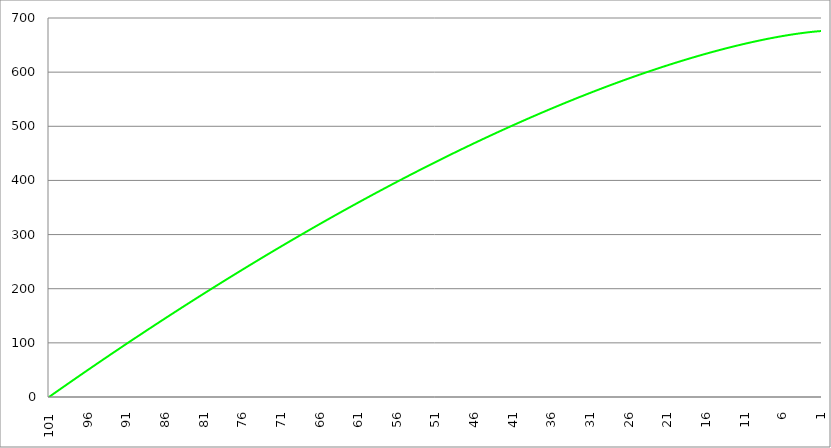
| Category | Series 1 | Series 0 | Series 2 |
|---|---|---|---|
| 101.0 |  | 0 |  |
| 100.95 |  | 0.502 |  |
| 100.9 |  | 1.005 |  |
| 100.85 |  | 1.507 |  |
| 100.8 |  | 2.009 |  |
| 100.75 |  | 2.511 |  |
| 100.7 |  | 3.013 |  |
| 100.65 |  | 3.514 |  |
| 100.6 |  | 4.016 |  |
| 100.55 |  | 4.517 |  |
| 100.5 |  | 5.019 |  |
| 100.45 |  | 5.52 |  |
| 100.4 |  | 6.021 |  |
| 100.35 |  | 6.522 |  |
| 100.3 |  | 7.023 |  |
| 100.25 |  | 7.523 |  |
| 100.2 |  | 8.024 |  |
| 100.15 |  | 8.524 |  |
| 100.1000000000001 |  | 9.025 |  |
| 100.0500000000001 |  | 9.525 |  |
| 100.0000000000001 |  | 10.025 |  |
| 99.95000000000005 |  | 10.525 |  |
| 99.90000000000006 |  | 11.025 |  |
| 99.85000000000007 |  | 11.524 |  |
| 99.80000000000007 |  | 12.024 |  |
| 99.75000000000007 |  | 12.523 |  |
| 99.70000000000007 |  | 13.023 |  |
| 99.65000000000008 |  | 13.522 |  |
| 99.60000000000008 |  | 14.021 |  |
| 99.55000000000008 |  | 14.52 |  |
| 99.50000000000009 |  | 15.019 |  |
| 99.45000000000007 |  | 15.517 |  |
| 99.4000000000001 |  | 16.016 |  |
| 99.3500000000001 |  | 16.514 |  |
| 99.3000000000001 |  | 17.013 |  |
| 99.2500000000001 |  | 17.511 |  |
| 99.2000000000001 |  | 18.009 |  |
| 99.1500000000001 |  | 18.507 |  |
| 99.10000000000011 |  | 19.005 |  |
| 99.05000000000011 |  | 19.502 |  |
| 99.00000000000011 |  | 20 |  |
| 98.95000000000012 |  | 20.497 |  |
| 98.9000000000001 |  | 20.995 |  |
| 98.85000000000012 |  | 21.492 |  |
| 98.80000000000013 |  | 21.989 |  |
| 98.75000000000013 |  | 22.486 |  |
| 98.70000000000013 |  | 22.983 |  |
| 98.65000000000013 |  | 23.479 |  |
| 98.60000000000014 |  | 23.976 |  |
| 98.55000000000014 |  | 24.472 |  |
| 98.50000000000014 |  | 24.969 |  |
| 98.45000000000014 |  | 25.465 |  |
| 98.40000000000013 |  | 25.961 |  |
| 98.35000000000015 |  | 26.457 |  |
| 98.30000000000015 |  | 26.953 |  |
| 98.25000000000016 |  | 27.448 |  |
| 98.20000000000014 |  | 27.944 |  |
| 98.15000000000016 |  | 28.439 |  |
| 98.10000000000016 |  | 28.934 |  |
| 98.05000000000017 |  | 29.43 |  |
| 98.00000000000017 |  | 29.925 |  |
| 97.95000000000017 |  | 30.42 |  |
| 97.90000000000018 |  | 30.914 |  |
| 97.85000000000018 |  | 31.409 |  |
| 97.80000000000018 |  | 31.904 |  |
| 97.75000000000018 |  | 32.398 |  |
| 97.70000000000017 |  | 32.892 |  |
| 97.65000000000019 |  | 33.386 |  |
| 97.6000000000002 |  | 33.88 |  |
| 97.5500000000002 |  | 34.374 |  |
| 97.5000000000002 |  | 34.868 |  |
| 97.4500000000002 |  | 35.362 |  |
| 97.4000000000002 |  | 35.855 |  |
| 97.35000000000021 |  | 36.349 |  |
| 97.30000000000021 |  | 36.842 |  |
| 97.25000000000021 |  | 37.335 |  |
| 97.20000000000022 |  | 37.828 |  |
| 97.15000000000022 |  | 38.321 |  |
| 97.10000000000022 |  | 38.814 |  |
| 97.05000000000022 |  | 39.306 |  |
| 97.00000000000023 |  | 39.799 |  |
| 96.95000000000023 |  | 40.291 |  |
| 96.90000000000023 |  | 40.783 |  |
| 96.85000000000024 |  | 41.276 |  |
| 96.80000000000024 |  | 41.768 |  |
| 96.75000000000024 |  | 42.259 |  |
| 96.70000000000024 |  | 42.751 |  |
| 96.65000000000025 |  | 43.243 |  |
| 96.60000000000025 |  | 43.734 |  |
| 96.55000000000025 |  | 44.226 |  |
| 96.50000000000026 |  | 44.717 |  |
| 96.45000000000024 |  | 45.208 |  |
| 96.40000000000026 |  | 45.699 |  |
| 96.35000000000026 |  | 46.19 |  |
| 96.30000000000027 |  | 46.681 |  |
| 96.25000000000027 |  | 47.171 |  |
| 96.20000000000027 |  | 47.662 |  |
| 96.15000000000028 |  | 48.152 |  |
| 96.10000000000028 |  | 48.642 |  |
| 96.05000000000028 |  | 49.132 |  |
| 96.00000000000028 |  | 49.622 |  |
| 95.95000000000029 |  | 50.112 |  |
| 95.90000000000028 |  | 50.602 |  |
| 95.85000000000029 |  | 51.091 |  |
| 95.8000000000003 |  | 51.581 |  |
| 95.7500000000003 |  | 52.07 |  |
| 95.7000000000003 |  | 52.559 |  |
| 95.6500000000003 |  | 53.048 |  |
| 95.6000000000003 |  | 53.537 |  |
| 95.55000000000031 |  | 54.026 |  |
| 95.50000000000031 |  | 54.515 |  |
| 95.45000000000032 |  | 55.003 |  |
| 95.4000000000003 |  | 55.492 |  |
| 95.35000000000032 |  | 55.98 |  |
| 95.30000000000032 |  | 56.468 |  |
| 95.25000000000033 |  | 56.956 |  |
| 95.20000000000033 |  | 57.444 |  |
| 95.15000000000033 |  | 57.932 |  |
| 95.10000000000034 |  | 58.42 |  |
| 95.05000000000034 |  | 58.907 |  |
| 95.00000000000034 |  | 59.395 |  |
| 94.95000000000034 |  | 59.882 |  |
| 94.90000000000035 |  | 60.369 |  |
| 94.85000000000035 |  | 60.856 |  |
| 94.80000000000035 |  | 61.343 |  |
| 94.75000000000036 |  | 61.83 |  |
| 94.70000000000034 |  | 62.316 |  |
| 94.65000000000036 |  | 62.803 |  |
| 94.60000000000036 |  | 63.289 |  |
| 94.55000000000037 |  | 63.776 |  |
| 94.50000000000037 |  | 64.262 |  |
| 94.45000000000037 |  | 64.748 |  |
| 94.40000000000038 |  | 65.233 |  |
| 94.35000000000038 |  | 65.719 |  |
| 94.30000000000038 |  | 66.205 |  |
| 94.25000000000038 |  | 66.69 |  |
| 94.20000000000039 |  | 67.176 |  |
| 94.15000000000039 |  | 67.661 |  |
| 94.10000000000039 |  | 68.146 |  |
| 94.0500000000004 |  | 68.631 |  |
| 94.0000000000004 |  | 69.116 |  |
| 93.9500000000004 |  | 69.6 |  |
| 93.9000000000004 |  | 70.085 |  |
| 93.8500000000004 |  | 70.569 |  |
| 93.80000000000041 |  | 71.054 |  |
| 93.75000000000041 |  | 71.538 |  |
| 93.70000000000041 |  | 72.022 |  |
| 93.65000000000042 |  | 72.506 |  |
| 93.60000000000042 |  | 72.99 |  |
| 93.55000000000042 |  | 73.473 |  |
| 93.50000000000043 |  | 73.957 |  |
| 93.45000000000043 |  | 74.44 |  |
| 93.40000000000043 |  | 74.924 |  |
| 93.35000000000043 |  | 75.407 |  |
| 93.30000000000044 |  | 75.89 |  |
| 93.25000000000044 |  | 76.373 |  |
| 93.20000000000044 |  | 76.856 |  |
| 93.15000000000045 |  | 77.338 |  |
| 93.10000000000045 |  | 77.821 |  |
| 93.05000000000045 |  | 78.303 |  |
| 93.00000000000045 |  | 78.785 |  |
| 92.95000000000044 |  | 79.267 |  |
| 92.90000000000046 |  | 79.749 |  |
| 92.85000000000046 |  | 80.231 |  |
| 92.80000000000047 |  | 80.713 |  |
| 92.75000000000047 |  | 81.195 |  |
| 92.70000000000047 |  | 81.676 |  |
| 92.65000000000047 |  | 82.157 |  |
| 92.60000000000048 |  | 82.639 |  |
| 92.55000000000048 |  | 83.12 |  |
| 92.50000000000048 |  | 83.601 |  |
| 92.45000000000049 |  | 84.081 |  |
| 92.40000000000047 |  | 84.562 |  |
| 92.35000000000049 |  | 85.043 |  |
| 92.3000000000005 |  | 85.523 |  |
| 92.2500000000005 |  | 86.003 |  |
| 92.2000000000005 |  | 86.484 |  |
| 92.1500000000005 |  | 86.964 |  |
| 92.1000000000005 |  | 87.444 |  |
| 92.05000000000051 |  | 87.923 |  |
| 92.00000000000051 |  | 88.403 |  |
| 91.95000000000051 |  | 88.882 |  |
| 91.9000000000005 |  | 89.362 |  |
| 91.85000000000052 |  | 89.841 |  |
| 91.80000000000052 |  | 90.32 |  |
| 91.75000000000053 |  | 90.799 |  |
| 91.70000000000053 |  | 91.278 |  |
| 91.65000000000053 |  | 91.757 |  |
| 91.60000000000053 |  | 92.235 |  |
| 91.55000000000054 |  | 92.714 |  |
| 91.50000000000054 |  | 93.192 |  |
| 91.45000000000054 |  | 93.67 |  |
| 91.40000000000055 |  | 94.149 |  |
| 91.35000000000055 |  | 94.627 |  |
| 91.30000000000055 |  | 95.104 |  |
| 91.25000000000055 |  | 95.582 |  |
| 91.20000000000056 |  | 96.06 |  |
| 91.15000000000056 |  | 96.537 |  |
| 91.10000000000056 |  | 97.014 |  |
| 91.05000000000057 |  | 97.491 |  |
| 91.00000000000057 |  | 97.969 |  |
| 90.95000000000057 |  | 98.445 |  |
| 90.90000000000057 |  | 98.922 |  |
| 90.85000000000058 |  | 99.399 |  |
| 90.80000000000058 |  | 99.875 |  |
| 90.75000000000058 |  | 100.352 |  |
| 90.70000000000059 |  | 100.828 |  |
| 90.65000000000059 |  | 101.304 |  |
| 90.60000000000059 |  | 101.78 |  |
| 90.5500000000006 |  | 102.256 |  |
| 90.5000000000006 |  | 102.732 |  |
| 90.4500000000006 |  | 103.207 |  |
| 90.4000000000006 |  | 103.683 |  |
| 90.3500000000006 |  | 104.158 |  |
| 90.30000000000061 |  | 104.633 |  |
| 90.25000000000061 |  | 105.108 |  |
| 90.20000000000061 |  | 105.583 |  |
| 90.15000000000062 |  | 106.058 |  |
| 90.10000000000062 |  | 106.533 |  |
| 90.05000000000062 |  | 107.007 |  |
| 90.00000000000063 |  | 107.482 |  |
| 89.95000000000063 |  | 107.956 |  |
| 89.90000000000063 |  | 108.43 |  |
| 89.85000000000063 |  | 108.904 |  |
| 89.80000000000064 |  | 109.378 |  |
| 89.75000000000064 |  | 109.852 |  |
| 89.70000000000064 |  | 110.325 |  |
| 89.65000000000065 |  | 110.799 |  |
| 89.60000000000065 |  | 111.272 |  |
| 89.55000000000065 |  | 111.745 |  |
| 89.50000000000065 |  | 112.218 |  |
| 89.45000000000066 |  | 112.691 |  |
| 89.40000000000065 |  | 113.164 |  |
| 89.35000000000066 |  | 113.637 |  |
| 89.30000000000067 |  | 114.109 |  |
| 89.25000000000067 |  | 114.582 |  |
| 89.20000000000067 |  | 115.054 |  |
| 89.15000000000067 |  | 115.526 |  |
| 89.10000000000068 |  | 115.998 |  |
| 89.05000000000068 |  | 116.47 |  |
| 89.00000000000068 |  | 116.942 |  |
| 88.95000000000068 |  | 117.414 |  |
| 88.90000000000067 |  | 117.885 |  |
| 88.85000000000069 |  | 118.357 |  |
| 88.8000000000007 |  | 118.828 |  |
| 88.7500000000007 |  | 119.299 |  |
| 88.7000000000007 |  | 119.77 |  |
| 88.6500000000007 |  | 120.241 |  |
| 88.6000000000007 |  | 120.711 |  |
| 88.55000000000071 |  | 121.182 |  |
| 88.50000000000071 |  | 121.652 |  |
| 88.45000000000071 |  | 122.123 |  |
| 88.40000000000072 |  | 122.593 |  |
| 88.35000000000072 |  | 123.063 |  |
| 88.30000000000072 |  | 123.533 |  |
| 88.25000000000072 |  | 124.003 |  |
| 88.20000000000073 |  | 124.472 |  |
| 88.15000000000073 |  | 124.942 |  |
| 88.10000000000073 |  | 125.411 |  |
| 88.05000000000074 |  | 125.88 |  |
| 88.00000000000074 |  | 126.35 |  |
| 87.95000000000074 |  | 126.818 |  |
| 87.90000000000074 |  | 127.287 |  |
| 87.85000000000075 |  | 127.756 |  |
| 87.80000000000075 |  | 128.225 |  |
| 87.75000000000075 |  | 128.693 |  |
| 87.70000000000076 |  | 129.161 |  |
| 87.65000000000076 |  | 129.63 |  |
| 87.60000000000076 |  | 130.098 |  |
| 87.55000000000076 |  | 130.565 |  |
| 87.50000000000077 |  | 131.033 |  |
| 87.45000000000077 |  | 131.501 |  |
| 87.40000000000077 |  | 131.968 |  |
| 87.35000000000078 |  | 132.436 |  |
| 87.30000000000078 |  | 132.903 |  |
| 87.25000000000078 |  | 133.37 |  |
| 87.20000000000078 |  | 133.837 |  |
| 87.15000000000079 |  | 134.304 |  |
| 87.10000000000079 |  | 134.771 |  |
| 87.0500000000008 |  | 135.237 |  |
| 87.0000000000008 |  | 135.704 |  |
| 86.9500000000008 |  | 136.17 |  |
| 86.9000000000008 |  | 136.636 |  |
| 86.8500000000008 |  | 137.102 |  |
| 86.80000000000081 |  | 137.568 |  |
| 86.75000000000081 |  | 138.034 |  |
| 86.70000000000081 |  | 138.499 |  |
| 86.65000000000082 |  | 138.965 |  |
| 86.60000000000082 |  | 139.43 |  |
| 86.55000000000082 |  | 139.896 |  |
| 86.50000000000082 |  | 140.361 |  |
| 86.45000000000083 |  | 140.826 |  |
| 86.40000000000083 |  | 141.29 |  |
| 86.35000000000083 |  | 141.755 |  |
| 86.30000000000084 |  | 142.22 |  |
| 86.25000000000084 |  | 142.684 |  |
| 86.20000000000084 |  | 143.148 |  |
| 86.15000000000084 |  | 143.613 |  |
| 86.10000000000085 |  | 144.077 |  |
| 86.05000000000085 |  | 144.54 |  |
| 86.00000000000085 |  | 145.004 |  |
| 85.95000000000086 |  | 145.468 |  |
| 85.90000000000084 |  | 145.931 |  |
| 85.85000000000086 |  | 146.395 |  |
| 85.80000000000086 |  | 146.858 |  |
| 85.75000000000087 |  | 147.321 |  |
| 85.70000000000087 |  | 147.784 |  |
| 85.65000000000087 |  | 148.247 |  |
| 85.60000000000088 |  | 148.709 |  |
| 85.55000000000088 |  | 149.172 |  |
| 85.50000000000088 |  | 149.634 |  |
| 85.45000000000088 |  | 150.096 |  |
| 85.40000000000089 |  | 150.559 |  |
| 85.35000000000089 |  | 151.021 |  |
| 85.30000000000089 |  | 151.482 |  |
| 85.2500000000009 |  | 151.944 |  |
| 85.2000000000009 |  | 152.406 |  |
| 85.1500000000009 |  | 152.867 |  |
| 85.1000000000009 |  | 153.329 |  |
| 85.0500000000009 |  | 153.79 |  |
| 85.00000000000091 |  | 154.251 |  |
| 84.95000000000091 |  | 154.712 |  |
| 84.90000000000092 |  | 155.172 |  |
| 84.85000000000092 |  | 155.633 |  |
| 84.80000000000092 |  | 156.094 |  |
| 84.75000000000092 |  | 156.554 |  |
| 84.70000000000093 |  | 157.014 |  |
| 84.65000000000093 |  | 157.474 |  |
| 84.60000000000093 |  | 157.934 |  |
| 84.55000000000094 |  | 158.394 |  |
| 84.50000000000094 |  | 158.854 |  |
| 84.45000000000094 |  | 159.313 |  |
| 84.40000000000094 |  | 159.773 |  |
| 84.35000000000095 |  | 160.232 |  |
| 84.30000000000095 |  | 160.691 |  |
| 84.25000000000095 |  | 161.15 |  |
| 84.20000000000095 |  | 161.609 |  |
| 84.15000000000096 |  | 162.068 |  |
| 84.10000000000096 |  | 162.526 |  |
| 84.05000000000096 |  | 162.985 |  |
| 84.00000000000097 |  | 163.443 |  |
| 83.95000000000097 |  | 163.901 |  |
| 83.90000000000097 |  | 164.359 |  |
| 83.85000000000097 |  | 164.817 |  |
| 83.80000000000098 |  | 165.275 |  |
| 83.75000000000098 |  | 165.733 |  |
| 83.70000000000098 |  | 166.19 |  |
| 83.65000000000099 |  | 166.648 |  |
| 83.60000000000099 |  | 167.105 |  |
| 83.55000000000099 |  | 167.562 |  |
| 83.500000000001 |  | 168.019 |  |
| 83.450000000001 |  | 168.476 |  |
| 83.400000000001 |  | 168.932 |  |
| 83.350000000001 |  | 169.389 |  |
| 83.300000000001 |  | 169.845 |  |
| 83.25000000000101 |  | 170.302 |  |
| 83.20000000000101 |  | 170.758 |  |
| 83.15000000000101 |  | 171.214 |  |
| 83.10000000000102 |  | 171.67 |  |
| 83.05000000000102 |  | 172.125 |  |
| 83.00000000000102 |  | 172.581 |  |
| 82.95000000000103 |  | 173.036 |  |
| 82.90000000000103 |  | 173.492 |  |
| 82.85000000000103 |  | 173.947 |  |
| 82.80000000000103 |  | 174.402 |  |
| 82.75000000000104 |  | 174.857 |  |
| 82.70000000000104 |  | 175.312 |  |
| 82.65000000000104 |  | 175.766 |  |
| 82.60000000000105 |  | 176.221 |  |
| 82.55000000000105 |  | 176.675 |  |
| 82.50000000000105 |  | 177.129 |  |
| 82.45000000000105 |  | 177.583 |  |
| 82.40000000000104 |  | 178.037 |  |
| 82.35000000000106 |  | 178.491 |  |
| 82.30000000000106 |  | 178.945 |  |
| 82.25000000000107 |  | 179.398 |  |
| 82.20000000000107 |  | 179.852 |  |
| 82.15000000000107 |  | 180.305 |  |
| 82.10000000000107 |  | 180.758 |  |
| 82.05000000000108 |  | 181.211 |  |
| 82.00000000000108 |  | 181.664 |  |
| 81.95000000000108 |  | 182.117 |  |
| 81.90000000000109 |  | 182.569 |  |
| 81.85000000000109 |  | 183.022 |  |
| 81.80000000000109 |  | 183.474 |  |
| 81.7500000000011 |  | 183.926 |  |
| 81.7000000000011 |  | 184.378 |  |
| 81.6500000000011 |  | 184.83 |  |
| 81.6000000000011 |  | 185.282 |  |
| 81.5500000000011 |  | 185.733 |  |
| 81.50000000000111 |  | 186.185 |  |
| 81.45000000000111 |  | 186.636 |  |
| 81.40000000000111 |  | 187.087 |  |
| 81.35000000000112 |  | 187.538 |  |
| 81.30000000000112 |  | 187.989 |  |
| 81.25000000000112 |  | 188.44 |  |
| 81.20000000000113 |  | 188.891 |  |
| 81.15000000000113 |  | 189.341 |  |
| 81.10000000000113 |  | 189.791 |  |
| 81.05000000000113 |  | 190.242 |  |
| 81.00000000000114 |  | 190.692 |  |
| 80.95000000000114 |  | 191.142 |  |
| 80.90000000000114 |  | 191.591 |  |
| 80.85000000000115 |  | 192.041 |  |
| 80.80000000000115 |  | 192.491 |  |
| 80.75000000000115 |  | 192.94 |  |
| 80.70000000000115 |  | 193.389 |  |
| 80.65000000000116 |  | 193.838 |  |
| 80.60000000000116 |  | 194.287 |  |
| 80.55000000000116 |  | 194.736 |  |
| 80.50000000000117 |  | 195.185 |  |
| 80.45000000000117 |  | 195.633 |  |
| 80.40000000000117 |  | 196.082 |  |
| 80.35000000000117 |  | 196.53 |  |
| 80.30000000000118 |  | 196.978 |  |
| 80.25000000000118 |  | 197.426 |  |
| 80.20000000000118 |  | 197.874 |  |
| 80.15000000000119 |  | 198.322 |  |
| 80.10000000000119 |  | 198.769 |  |
| 80.05000000000119 |  | 199.217 |  |
| 80.0000000000012 |  | 199.664 |  |
| 79.9500000000012 |  | 200.111 |  |
| 79.9000000000012 |  | 200.558 |  |
| 79.8500000000012 |  | 201.005 |  |
| 79.8000000000012 |  | 201.452 |  |
| 79.75000000000121 |  | 201.898 |  |
| 79.70000000000121 |  | 202.345 |  |
| 79.65000000000121 |  | 202.791 |  |
| 79.60000000000122 |  | 203.237 |  |
| 79.55000000000122 |  | 203.683 |  |
| 79.50000000000122 |  | 204.129 |  |
| 79.45000000000122 |  | 204.575 |  |
| 79.40000000000123 |  | 205.02 |  |
| 79.35000000000123 |  | 205.466 |  |
| 79.30000000000123 |  | 205.911 |  |
| 79.25000000000124 |  | 206.356 |  |
| 79.20000000000124 |  | 206.801 |  |
| 79.15000000000124 |  | 207.246 |  |
| 79.10000000000124 |  | 207.691 |  |
| 79.05000000000125 |  | 208.136 |  |
| 79.00000000000125 |  | 208.58 |  |
| 78.95000000000125 |  | 209.024 |  |
| 78.90000000000126 |  | 209.469 |  |
| 78.85000000000126 |  | 209.913 |  |
| 78.80000000000126 |  | 210.357 |  |
| 78.75000000000126 |  | 210.8 |  |
| 78.70000000000127 |  | 211.244 |  |
| 78.65000000000127 |  | 211.687 |  |
| 78.60000000000127 |  | 212.131 |  |
| 78.55000000000128 |  | 212.574 |  |
| 78.50000000000128 |  | 213.017 |  |
| 78.45000000000128 |  | 213.46 |  |
| 78.40000000000128 |  | 213.903 |  |
| 78.35000000000129 |  | 214.345 |  |
| 78.30000000000129 |  | 214.788 |  |
| 78.2500000000013 |  | 215.23 |  |
| 78.2000000000013 |  | 215.673 |  |
| 78.1500000000013 |  | 216.115 |  |
| 78.1000000000013 |  | 216.557 |  |
| 78.0500000000013 |  | 216.998 |  |
| 78.00000000000131 |  | 217.44 |  |
| 77.95000000000131 |  | 217.882 |  |
| 77.90000000000131 |  | 218.323 |  |
| 77.85000000000132 |  | 218.764 |  |
| 77.80000000000132 |  | 219.205 |  |
| 77.75000000000132 |  | 219.646 |  |
| 77.70000000000132 |  | 220.087 |  |
| 77.65000000000133 |  | 220.528 |  |
| 77.60000000000133 |  | 220.968 |  |
| 77.55000000000133 |  | 221.409 |  |
| 77.50000000000134 |  | 221.849 |  |
| 77.45000000000134 |  | 222.289 |  |
| 77.40000000000134 |  | 222.729 |  |
| 77.35000000000134 |  | 223.169 |  |
| 77.30000000000135 |  | 223.608 |  |
| 77.25000000000135 |  | 224.048 |  |
| 77.20000000000135 |  | 224.487 |  |
| 77.15000000000136 |  | 224.927 |  |
| 77.10000000000136 |  | 225.366 |  |
| 77.05000000000136 |  | 225.805 |  |
| 77.00000000000136 |  | 226.243 |  |
| 76.95000000000137 |  | 226.682 |  |
| 76.90000000000137 |  | 227.121 |  |
| 76.85000000000137 |  | 227.559 |  |
| 76.80000000000138 |  | 227.997 |  |
| 76.75000000000138 |  | 228.435 |  |
| 76.70000000000138 |  | 228.873 |  |
| 76.65000000000138 |  | 229.311 |  |
| 76.60000000000139 |  | 229.749 |  |
| 76.55000000000139 |  | 230.186 |  |
| 76.50000000000139 |  | 230.624 |  |
| 76.4500000000014 |  | 231.061 |  |
| 76.4000000000014 |  | 231.498 |  |
| 76.3500000000014 |  | 231.935 |  |
| 76.3000000000014 |  | 232.372 |  |
| 76.2500000000014 |  | 232.809 |  |
| 76.20000000000141 |  | 233.245 |  |
| 76.15000000000141 |  | 233.682 |  |
| 76.10000000000142 |  | 234.118 |  |
| 76.05000000000142 |  | 234.554 |  |
| 76.00000000000142 |  | 234.99 |  |
| 75.95000000000142 |  | 235.426 |  |
| 75.90000000000143 |  | 235.861 |  |
| 75.85000000000143 |  | 236.297 |  |
| 75.80000000000143 |  | 236.732 |  |
| 75.75000000000144 |  | 237.168 |  |
| 75.70000000000144 |  | 237.603 |  |
| 75.65000000000144 |  | 238.038 |  |
| 75.60000000000144 |  | 238.472 |  |
| 75.55000000000145 |  | 238.907 |  |
| 75.50000000000145 |  | 239.342 |  |
| 75.45000000000145 |  | 239.776 |  |
| 75.40000000000146 |  | 240.21 |  |
| 75.35000000000146 |  | 240.644 |  |
| 75.30000000000146 |  | 241.078 |  |
| 75.25000000000146 |  | 241.512 |  |
| 75.20000000000147 |  | 241.946 |  |
| 75.15000000000147 |  | 242.379 |  |
| 75.10000000000147 |  | 242.813 |  |
| 75.05000000000148 |  | 243.246 |  |
| 75.00000000000148 |  | 243.679 |  |
| 74.95000000000148 |  | 244.112 |  |
| 74.90000000000148 |  | 244.545 |  |
| 74.85000000000149 |  | 244.977 |  |
| 74.80000000000149 |  | 245.41 |  |
| 74.75000000000149 |  | 245.842 |  |
| 74.7000000000015 |  | 246.274 |  |
| 74.6500000000015 |  | 246.706 |  |
| 74.6000000000015 |  | 247.138 |  |
| 74.5500000000015 |  | 247.57 |  |
| 74.5000000000015 |  | 248.002 |  |
| 74.45000000000151 |  | 248.433 |  |
| 74.40000000000151 |  | 248.865 |  |
| 74.35000000000151 |  | 249.296 |  |
| 74.30000000000152 |  | 249.727 |  |
| 74.25000000000152 |  | 250.158 |  |
| 74.20000000000152 |  | 250.589 |  |
| 74.15000000000153 |  | 251.019 |  |
| 74.10000000000153 |  | 251.45 |  |
| 74.05000000000153 |  | 251.88 |  |
| 74.00000000000153 |  | 252.31 |  |
| 73.95000000000154 |  | 252.74 |  |
| 73.90000000000154 |  | 253.17 |  |
| 73.85000000000154 |  | 253.6 |  |
| 73.80000000000155 |  | 254.03 |  |
| 73.75000000000155 |  | 254.459 |  |
| 73.70000000000155 |  | 254.888 |  |
| 73.65000000000155 |  | 255.317 |  |
| 73.60000000000156 |  | 255.747 |  |
| 73.55000000000156 |  | 256.175 |  |
| 73.50000000000156 |  | 256.604 |  |
| 73.45000000000157 |  | 257.033 |  |
| 73.40000000000157 |  | 257.461 |  |
| 73.35000000000157 |  | 257.889 |  |
| 73.30000000000157 |  | 258.318 |  |
| 73.25000000000158 |  | 258.746 |  |
| 73.20000000000158 |  | 259.173 |  |
| 73.15000000000158 |  | 259.601 |  |
| 73.10000000000159 |  | 260.029 |  |
| 73.05000000000159 |  | 260.456 |  |
| 73.00000000000159 |  | 260.883 |  |
| 72.9500000000016 |  | 261.311 |  |
| 72.9000000000016 |  | 261.738 |  |
| 72.8500000000016 |  | 262.164 |  |
| 72.8000000000016 |  | 262.591 |  |
| 72.7500000000016 |  | 263.018 |  |
| 72.70000000000161 |  | 263.444 |  |
| 72.65000000000161 |  | 263.87 |  |
| 72.60000000000161 |  | 264.296 |  |
| 72.55000000000162 |  | 264.722 |  |
| 72.50000000000162 |  | 265.148 |  |
| 72.45000000000162 |  | 265.574 |  |
| 72.40000000000163 |  | 265.999 |  |
| 72.35000000000163 |  | 266.425 |  |
| 72.30000000000163 |  | 266.85 |  |
| 72.25000000000163 |  | 267.275 |  |
| 72.20000000000164 |  | 267.7 |  |
| 72.15000000000164 |  | 268.125 |  |
| 72.10000000000164 |  | 268.549 |  |
| 72.05000000000165 |  | 268.974 |  |
| 72.00000000000165 |  | 269.398 |  |
| 71.95000000000165 |  | 269.822 |  |
| 71.90000000000165 |  | 270.246 |  |
| 71.85000000000166 |  | 270.67 |  |
| 71.80000000000166 |  | 271.094 |  |
| 71.75000000000166 |  | 271.518 |  |
| 71.70000000000167 |  | 271.941 |  |
| 71.65000000000167 |  | 272.364 |  |
| 71.60000000000167 |  | 272.788 |  |
| 71.55000000000167 |  | 273.211 |  |
| 71.50000000000168 |  | 273.633 |  |
| 71.45000000000168 |  | 274.056 |  |
| 71.40000000000168 |  | 274.479 |  |
| 71.35000000000169 |  | 274.901 |  |
| 71.30000000000169 |  | 275.323 |  |
| 71.25000000000169 |  | 275.745 |  |
| 71.2000000000017 |  | 276.167 |  |
| 71.1500000000017 |  | 276.589 |  |
| 71.1000000000017 |  | 277.011 |  |
| 71.0500000000017 |  | 277.432 |  |
| 71.0000000000017 |  | 277.854 |  |
| 70.95000000000171 |  | 278.275 |  |
| 70.90000000000171 |  | 278.696 |  |
| 70.85000000000171 |  | 279.117 |  |
| 70.80000000000172 |  | 279.538 |  |
| 70.75000000000172 |  | 279.959 |  |
| 70.70000000000172 |  | 280.379 |  |
| 70.65000000000173 |  | 280.799 |  |
| 70.60000000000173 |  | 281.22 |  |
| 70.55000000000173 |  | 281.64 |  |
| 70.50000000000173 |  | 282.06 |  |
| 70.45000000000174 |  | 282.479 |  |
| 70.40000000000174 |  | 282.899 |  |
| 70.35000000000174 |  | 283.318 |  |
| 70.30000000000175 |  | 283.738 |  |
| 70.25000000000175 |  | 284.157 |  |
| 70.20000000000175 |  | 284.576 |  |
| 70.15000000000175 |  | 284.995 |  |
| 70.10000000000176 |  | 285.413 |  |
| 70.05000000000176 |  | 285.832 |  |
| 70.00000000000176 |  | 286.25 |  |
| 69.95000000000176 |  | 286.669 |  |
| 69.90000000000177 |  | 287.087 |  |
| 69.85000000000177 |  | 287.505 |  |
| 69.80000000000177 |  | 287.922 |  |
| 69.75000000000178 |  | 288.34 |  |
| 69.70000000000178 |  | 288.758 |  |
| 69.65000000000178 |  | 289.175 |  |
| 69.60000000000178 |  | 289.592 |  |
| 69.55000000000179 |  | 290.009 |  |
| 69.50000000000179 |  | 290.426 |  |
| 69.4500000000018 |  | 290.843 |  |
| 69.4000000000018 |  | 291.259 |  |
| 69.3500000000018 |  | 291.676 |  |
| 69.3000000000018 |  | 292.092 |  |
| 69.2500000000018 |  | 292.508 |  |
| 69.20000000000181 |  | 292.924 |  |
| 69.15000000000181 |  | 293.34 |  |
| 69.10000000000181 |  | 293.756 |  |
| 69.05000000000182 |  | 294.172 |  |
| 69.00000000000182 |  | 294.587 |  |
| 68.95000000000182 |  | 295.002 |  |
| 68.90000000000182 |  | 295.417 |  |
| 68.85000000000183 |  | 295.832 |  |
| 68.80000000000183 |  | 296.247 |  |
| 68.75000000000183 |  | 296.662 |  |
| 68.70000000000184 |  | 297.076 |  |
| 68.65000000000184 |  | 297.491 |  |
| 68.60000000000184 |  | 297.905 |  |
| 68.55000000000184 |  | 298.319 |  |
| 68.50000000000185 |  | 298.733 |  |
| 68.45000000000185 |  | 299.146 |  |
| 68.40000000000185 |  | 299.56 |  |
| 68.35000000000186 |  | 299.973 |  |
| 68.30000000000186 |  | 300.387 |  |
| 68.25000000000186 |  | 300.8 |  |
| 68.20000000000186 |  | 301.213 |  |
| 68.15000000000187 |  | 301.626 |  |
| 68.10000000000187 |  | 302.038 |  |
| 68.05000000000187 |  | 302.451 |  |
| 68.00000000000188 |  | 302.863 |  |
| 67.95000000000188 |  | 303.276 |  |
| 67.90000000000188 |  | 303.688 |  |
| 67.85000000000188 |  | 304.1 |  |
| 67.80000000000189 |  | 304.511 |  |
| 67.75000000000189 |  | 304.923 |  |
| 67.70000000000189 |  | 305.335 |  |
| 67.6500000000019 |  | 305.746 |  |
| 67.6000000000019 |  | 306.157 |  |
| 67.5500000000019 |  | 306.568 |  |
| 67.5000000000019 |  | 306.979 |  |
| 67.4500000000019 |  | 307.39 |  |
| 67.40000000000191 |  | 307.8 |  |
| 67.35000000000191 |  | 308.211 |  |
| 67.30000000000192 |  | 308.621 |  |
| 67.25000000000192 |  | 309.031 |  |
| 67.20000000000192 |  | 309.441 |  |
| 67.15000000000192 |  | 309.851 |  |
| 67.10000000000193 |  | 310.26 |  |
| 67.05000000000193 |  | 310.67 |  |
| 67.00000000000193 |  | 311.079 |  |
| 66.95000000000194 |  | 311.488 |  |
| 66.90000000000194 |  | 311.897 |  |
| 66.85000000000194 |  | 312.306 |  |
| 66.80000000000194 |  | 312.715 |  |
| 66.75000000000195 |  | 313.124 |  |
| 66.70000000000195 |  | 313.532 |  |
| 66.65000000000195 |  | 313.94 |  |
| 66.60000000000196 |  | 314.348 |  |
| 66.55000000000196 |  | 314.756 |  |
| 66.50000000000196 |  | 315.164 |  |
| 66.45000000000196 |  | 315.572 |  |
| 66.40000000000197 |  | 315.979 |  |
| 66.35000000000197 |  | 316.387 |  |
| 66.30000000000197 |  | 316.794 |  |
| 66.25000000000198 |  | 317.201 |  |
| 66.20000000000198 |  | 317.608 |  |
| 66.15000000000198 |  | 318.015 |  |
| 66.10000000000198 |  | 318.421 |  |
| 66.05000000000199 |  | 318.828 |  |
| 66.00000000000199 |  | 319.234 |  |
| 65.95000000000199 |  | 319.64 |  |
| 65.900000000002 |  | 320.046 |  |
| 65.850000000002 |  | 320.452 |  |
| 65.800000000002 |  | 320.858 |  |
| 65.750000000002 |  | 321.263 |  |
| 65.700000000002 |  | 321.668 |  |
| 65.65000000000201 |  | 322.074 |  |
| 65.60000000000201 |  | 322.479 |  |
| 65.55000000000202 |  | 322.884 |  |
| 65.500000000002 |  | 323.288 |  |
| 65.45000000000202 |  | 323.693 |  |
| 65.40000000000202 |  | 324.097 |  |
| 65.35000000000203 |  | 324.502 |  |
| 65.30000000000203 |  | 324.906 |  |
| 65.25000000000203 |  | 325.31 |  |
| 65.20000000000203 |  | 325.713 |  |
| 65.15000000000204 |  | 326.117 |  |
| 65.10000000000204 |  | 326.521 |  |
| 65.05000000000204 |  | 326.924 |  |
| 65.00000000000205 |  | 327.327 |  |
| 64.95000000000203 |  | 327.73 |  |
| 64.90000000000205 |  | 328.133 |  |
| 64.85000000000205 |  | 328.536 |  |
| 64.80000000000204 |  | 328.938 |  |
| 64.75000000000206 |  | 329.341 |  |
| 64.70000000000206 |  | 329.743 |  |
| 64.65000000000207 |  | 330.145 |  |
| 64.60000000000207 |  | 330.547 |  |
| 64.55000000000207 |  | 330.949 |  |
| 64.50000000000207 |  | 331.35 |  |
| 64.45000000000206 |  | 331.752 |  |
| 64.40000000000208 |  | 332.153 |  |
| 64.35000000000208 |  | 332.554 |  |
| 64.30000000000209 |  | 332.955 |  |
| 64.25000000000207 |  | 333.356 |  |
| 64.2000000000021 |  | 333.757 |  |
| 64.1500000000021 |  | 334.158 |  |
| 64.1000000000021 |  | 334.558 |  |
| 64.0500000000021 |  | 334.958 |  |
| 64.0000000000021 |  | 335.358 |  |
| 63.95000000000211 |  | 335.758 |  |
| 63.90000000000211 |  | 336.158 |  |
| 63.85000000000211 |  | 336.558 |  |
| 63.80000000000211 |  | 336.957 |  |
| 63.75000000000212 |  | 337.356 |  |
| 63.70000000000212 |  | 337.755 |  |
| 63.65000000000212 |  | 338.154 |  |
| 63.60000000000213 |  | 338.553 |  |
| 63.55000000000213 |  | 338.952 |  |
| 63.50000000000213 |  | 339.35 |  |
| 63.45000000000213 |  | 339.749 |  |
| 63.40000000000214 |  | 340.147 |  |
| 63.35000000000214 |  | 340.545 |  |
| 63.30000000000214 |  | 340.943 |  |
| 63.25000000000215 |  | 341.341 |  |
| 63.20000000000215 |  | 341.738 |  |
| 63.15000000000215 |  | 342.136 |  |
| 63.10000000000215 |  | 342.533 |  |
| 63.05000000000216 |  | 342.93 |  |
| 63.00000000000216 |  | 343.327 |  |
| 62.95000000000216 |  | 343.724 |  |
| 62.90000000000217 |  | 344.12 |  |
| 62.85000000000217 |  | 344.517 |  |
| 62.80000000000217 |  | 344.913 |  |
| 62.75000000000217 |  | 345.309 |  |
| 62.70000000000218 |  | 345.705 |  |
| 62.65000000000218 |  | 346.101 |  |
| 62.60000000000218 |  | 346.497 |  |
| 62.55000000000219 |  | 346.892 |  |
| 62.50000000000219 |  | 347.288 |  |
| 62.45000000000219 |  | 347.683 |  |
| 62.40000000000219 |  | 348.078 |  |
| 62.3500000000022 |  | 348.473 |  |
| 62.3000000000022 |  | 348.868 |  |
| 62.2500000000022 |  | 349.262 |  |
| 62.20000000000221 |  | 349.657 |  |
| 62.15000000000221 |  | 350.051 |  |
| 62.10000000000221 |  | 350.445 |  |
| 62.05000000000221 |  | 350.839 |  |
| 62.00000000000222 |  | 351.233 |  |
| 61.95000000000222 |  | 351.626 |  |
| 61.90000000000222 |  | 352.02 |  |
| 61.85000000000223 |  | 352.413 |  |
| 61.80000000000223 |  | 352.806 |  |
| 61.75000000000223 |  | 353.199 |  |
| 61.70000000000223 |  | 353.592 |  |
| 61.65000000000224 |  | 353.985 |  |
| 61.60000000000224 |  | 354.377 |  |
| 61.55000000000224 |  | 354.769 |  |
| 61.50000000000225 |  | 355.162 |  |
| 61.45000000000225 |  | 355.554 |  |
| 61.40000000000225 |  | 355.946 |  |
| 61.35000000000225 |  | 356.337 |  |
| 61.30000000000226 |  | 356.729 |  |
| 61.25000000000226 |  | 357.12 |  |
| 61.20000000000226 |  | 357.511 |  |
| 61.15000000000227 |  | 357.903 |  |
| 61.10000000000227 |  | 358.293 |  |
| 61.05000000000227 |  | 358.684 |  |
| 61.00000000000227 |  | 359.075 |  |
| 60.95000000000228 |  | 359.465 |  |
| 60.90000000000228 |  | 359.856 |  |
| 60.85000000000228 |  | 360.246 |  |
| 60.80000000000229 |  | 360.636 |  |
| 60.75000000000229 |  | 361.025 |  |
| 60.7000000000023 |  | 361.415 |  |
| 60.65000000000229 |  | 361.804 |  |
| 60.6000000000023 |  | 362.194 |  |
| 60.5500000000023 |  | 362.583 |  |
| 60.5000000000023 |  | 362.972 |  |
| 60.4500000000023 |  | 363.361 |  |
| 60.40000000000231 |  | 363.749 |  |
| 60.35000000000231 |  | 364.138 |  |
| 60.30000000000231 |  | 364.526 |  |
| 60.25000000000232 |  | 364.914 |  |
| 60.20000000000232 |  | 365.302 |  |
| 60.15000000000232 |  | 365.69 |  |
| 60.10000000000232 |  | 366.078 |  |
| 60.05000000000233 |  | 366.466 |  |
| 60.00000000000233 |  | 366.853 |  |
| 59.95000000000233 |  | 367.24 |  |
| 59.90000000000234 |  | 367.627 |  |
| 59.85000000000234 |  | 368.014 |  |
| 59.80000000000234 |  | 368.401 |  |
| 59.75000000000234 |  | 368.787 |  |
| 59.70000000000235 |  | 369.174 |  |
| 59.65000000000235 |  | 369.56 |  |
| 59.60000000000235 |  | 369.946 |  |
| 59.55000000000236 |  | 370.332 |  |
| 59.50000000000236 |  | 370.718 |  |
| 59.45000000000236 |  | 371.103 |  |
| 59.40000000000236 |  | 371.489 |  |
| 59.35000000000237 |  | 371.874 |  |
| 59.30000000000237 |  | 372.259 |  |
| 59.25000000000237 |  | 372.644 |  |
| 59.20000000000238 |  | 373.029 |  |
| 59.15000000000238 |  | 373.414 |  |
| 59.10000000000238 |  | 373.798 |  |
| 59.05000000000238 |  | 374.182 |  |
| 59.00000000000239 |  | 374.567 |  |
| 58.95000000000239 |  | 374.951 |  |
| 58.90000000000239 |  | 375.334 |  |
| 58.8500000000024 |  | 375.718 |  |
| 58.8000000000024 |  | 376.101 |  |
| 58.7500000000024 |  | 376.485 |  |
| 58.7000000000024 |  | 376.868 |  |
| 58.65000000000241 |  | 377.251 |  |
| 58.60000000000241 |  | 377.634 |  |
| 58.55000000000241 |  | 378.016 |  |
| 58.50000000000242 |  | 378.399 |  |
| 58.45000000000242 |  | 378.781 |  |
| 58.40000000000242 |  | 379.164 |  |
| 58.35000000000242 |  | 379.546 |  |
| 58.30000000000243 |  | 379.927 |  |
| 58.25000000000243 |  | 380.309 |  |
| 58.20000000000243 |  | 380.691 |  |
| 58.15000000000244 |  | 381.072 |  |
| 58.10000000000244 |  | 381.453 |  |
| 58.05000000000244 |  | 381.834 |  |
| 58.00000000000244 |  | 382.215 |  |
| 57.95000000000245 |  | 382.596 |  |
| 57.90000000000245 |  | 382.976 |  |
| 57.85000000000245 |  | 383.357 |  |
| 57.80000000000246 |  | 383.737 |  |
| 57.75000000000246 |  | 384.117 |  |
| 57.70000000000246 |  | 384.497 |  |
| 57.65000000000246 |  | 384.877 |  |
| 57.60000000000247 |  | 385.256 |  |
| 57.55000000000247 |  | 385.636 |  |
| 57.50000000000247 |  | 386.015 |  |
| 57.45000000000248 |  | 386.394 |  |
| 57.40000000000248 |  | 386.773 |  |
| 57.35000000000248 |  | 387.151 |  |
| 57.30000000000248 |  | 387.53 |  |
| 57.25000000000249 |  | 387.908 |  |
| 57.20000000000249 |  | 388.287 |  |
| 57.15000000000249 |  | 388.665 |  |
| 57.1000000000025 |  | 389.043 |  |
| 57.0500000000025 |  | 389.42 |  |
| 57.0000000000025 |  | 389.798 |  |
| 56.9500000000025 |  | 390.175 |  |
| 56.90000000000251 |  | 390.553 |  |
| 56.85000000000251 |  | 390.93 |  |
| 56.80000000000251 |  | 391.307 |  |
| 56.75000000000252 |  | 391.683 |  |
| 56.70000000000252 |  | 392.06 |  |
| 56.65000000000252 |  | 392.436 |  |
| 56.60000000000252 |  | 392.813 |  |
| 56.55000000000253 |  | 393.189 |  |
| 56.50000000000253 |  | 393.565 |  |
| 56.45000000000253 |  | 393.94 |  |
| 56.40000000000254 |  | 394.316 |  |
| 56.35000000000254 |  | 394.691 |  |
| 56.30000000000254 |  | 395.067 |  |
| 56.25000000000254 |  | 395.442 |  |
| 56.20000000000255 |  | 395.817 |  |
| 56.15000000000255 |  | 396.191 |  |
| 56.10000000000255 |  | 396.566 |  |
| 56.05000000000256 |  | 396.94 |  |
| 56.00000000000256 |  | 397.315 |  |
| 55.95000000000256 |  | 397.689 |  |
| 55.90000000000256 |  | 398.063 |  |
| 55.85000000000257 |  | 398.436 |  |
| 55.80000000000257 |  | 398.81 |  |
| 55.75000000000257 |  | 399.183 |  |
| 55.70000000000257 |  | 399.557 |  |
| 55.65000000000258 |  | 399.93 |  |
| 55.60000000000258 |  | 400.303 |  |
| 55.55000000000258 |  | 400.675 |  |
| 55.50000000000259 |  | 401.048 |  |
| 55.45000000000259 |  | 401.42 |  |
| 55.40000000000259 |  | 401.792 |  |
| 55.35000000000259 |  | 402.165 |  |
| 55.3000000000026 |  | 402.536 |  |
| 55.2500000000026 |  | 402.908 |  |
| 55.2000000000026 |  | 403.28 |  |
| 55.15000000000261 |  | 403.651 |  |
| 55.10000000000261 |  | 404.022 |  |
| 55.05000000000261 |  | 404.393 |  |
| 55.00000000000261 |  | 404.764 |  |
| 54.95000000000262 |  | 405.135 |  |
| 54.90000000000262 |  | 405.506 |  |
| 54.85000000000262 |  | 405.876 |  |
| 54.80000000000263 |  | 406.246 |  |
| 54.75000000000263 |  | 406.616 |  |
| 54.70000000000263 |  | 406.986 |  |
| 54.65000000000263 |  | 407.356 |  |
| 54.60000000000264 |  | 407.725 |  |
| 54.55000000000264 |  | 408.095 |  |
| 54.50000000000264 |  | 408.464 |  |
| 54.45000000000265 |  | 408.833 |  |
| 54.40000000000265 |  | 409.202 |  |
| 54.35000000000265 |  | 409.571 |  |
| 54.30000000000265 |  | 409.939 |  |
| 54.25000000000266 |  | 410.307 |  |
| 54.20000000000266 |  | 410.676 |  |
| 54.15000000000266 |  | 411.044 |  |
| 54.10000000000267 |  | 411.412 |  |
| 54.05000000000267 |  | 411.779 |  |
| 54.00000000000267 |  | 412.147 |  |
| 53.95000000000267 |  | 412.514 |  |
| 53.90000000000268 |  | 412.881 |  |
| 53.85000000000268 |  | 413.248 |  |
| 53.80000000000268 |  | 413.615 |  |
| 53.75000000000269 |  | 413.982 |  |
| 53.70000000000269 |  | 414.348 |  |
| 53.65000000000269 |  | 414.715 |  |
| 53.60000000000269 |  | 415.081 |  |
| 53.5500000000027 |  | 415.447 |  |
| 53.5000000000027 |  | 415.812 |  |
| 53.4500000000027 |  | 416.178 |  |
| 53.40000000000271 |  | 416.544 |  |
| 53.35000000000271 |  | 416.909 |  |
| 53.30000000000271 |  | 417.274 |  |
| 53.25000000000271 |  | 417.639 |  |
| 53.20000000000272 |  | 418.004 |  |
| 53.15000000000272 |  | 418.368 |  |
| 53.10000000000272 |  | 418.733 |  |
| 53.05000000000273 |  | 419.097 |  |
| 53.00000000000273 |  | 419.461 |  |
| 52.95000000000273 |  | 419.825 |  |
| 52.90000000000273 |  | 420.189 |  |
| 52.85000000000274 |  | 420.552 |  |
| 52.80000000000274 |  | 420.916 |  |
| 52.75000000000274 |  | 421.279 |  |
| 52.70000000000274 |  | 421.642 |  |
| 52.65000000000275 |  | 422.005 |  |
| 52.60000000000275 |  | 422.368 |  |
| 52.55000000000275 |  | 422.73 |  |
| 52.50000000000276 |  | 423.093 |  |
| 52.45000000000276 |  | 423.455 |  |
| 52.40000000000276 |  | 423.817 |  |
| 52.35000000000277 |  | 424.179 |  |
| 52.30000000000277 |  | 424.54 |  |
| 52.25000000000277 |  | 424.902 |  |
| 52.20000000000277 |  | 425.263 |  |
| 52.15000000000278 |  | 425.624 |  |
| 52.10000000000278 |  | 425.985 |  |
| 52.05000000000278 |  | 426.346 |  |
| 52.00000000000279 |  | 426.707 |  |
| 51.95000000000279 |  | 427.067 |  |
| 51.9000000000028 |  | 427.428 |  |
| 51.85000000000279 |  | 427.788 |  |
| 51.8000000000028 |  | 428.148 |  |
| 51.7500000000028 |  | 428.507 |  |
| 51.7000000000028 |  | 428.867 |  |
| 51.65000000000281 |  | 429.226 |  |
| 51.60000000000281 |  | 429.586 |  |
| 51.55000000000281 |  | 429.945 |  |
| 51.50000000000281 |  | 430.304 |  |
| 51.45000000000282 |  | 430.662 |  |
| 51.40000000000282 |  | 431.021 |  |
| 51.35000000000282 |  | 431.379 |  |
| 51.30000000000283 |  | 431.737 |  |
| 51.25000000000283 |  | 432.096 |  |
| 51.20000000000283 |  | 432.453 |  |
| 51.15000000000283 |  | 432.811 |  |
| 51.10000000000284 |  | 433.169 |  |
| 51.05000000000284 |  | 433.526 |  |
| 51.00000000000284 |  | 433.883 |  |
| 50.95000000000284 |  | 434.24 |  |
| 50.90000000000285 |  | 434.597 |  |
| 50.85000000000285 |  | 434.953 |  |
| 50.80000000000285 |  | 435.31 |  |
| 50.75000000000286 |  | 435.666 |  |
| 50.70000000000286 |  | 436.022 |  |
| 50.65000000000286 |  | 436.378 |  |
| 50.60000000000286 |  | 436.734 |  |
| 50.55000000000287 |  | 437.09 |  |
| 50.50000000000287 |  | 437.445 |  |
| 50.45000000000287 |  | 437.8 |  |
| 50.40000000000288 |  | 438.155 |  |
| 50.35000000000288 |  | 438.51 |  |
| 50.30000000000288 |  | 438.865 |  |
| 50.25000000000288 |  | 439.219 |  |
| 50.20000000000289 |  | 439.574 |  |
| 50.1500000000029 |  | 439.928 |  |
| 50.1000000000029 |  | 440.282 |  |
| 50.0500000000029 |  | 440.636 |  |
| 50.0000000000029 |  | 440.989 |  |
| 49.9500000000029 |  | 441.343 |  |
| 49.9000000000029 |  | 441.696 |  |
| 49.85000000000291 |  | 442.049 |  |
| 49.80000000000291 |  | 442.402 |  |
| 49.75000000000291 |  | 442.755 |  |
| 49.70000000000292 |  | 443.107 |  |
| 49.65000000000292 |  | 443.46 |  |
| 49.60000000000292 |  | 443.812 |  |
| 49.55000000000292 |  | 444.164 |  |
| 49.50000000000293 |  | 444.516 |  |
| 49.45000000000293 |  | 444.868 |  |
| 49.40000000000293 |  | 445.219 |  |
| 49.35000000000294 |  | 445.571 |  |
| 49.30000000000294 |  | 445.922 |  |
| 49.25000000000294 |  | 446.273 |  |
| 49.20000000000294 |  | 446.624 |  |
| 49.15000000000295 |  | 446.974 |  |
| 49.10000000000295 |  | 447.325 |  |
| 49.05000000000295 |  | 447.675 |  |
| 49.00000000000296 |  | 448.025 |  |
| 48.95000000000296 |  | 448.375 |  |
| 48.90000000000296 |  | 448.725 |  |
| 48.85000000000296 |  | 449.074 |  |
| 48.80000000000297 |  | 449.424 |  |
| 48.75000000000297 |  | 449.773 |  |
| 48.70000000000297 |  | 450.122 |  |
| 48.65000000000298 |  | 450.471 |  |
| 48.60000000000298 |  | 450.819 |  |
| 48.55000000000298 |  | 451.168 |  |
| 48.50000000000298 |  | 451.516 |  |
| 48.45000000000299 |  | 451.864 |  |
| 48.40000000000299 |  | 452.212 |  |
| 48.35000000000299 |  | 452.56 |  |
| 48.300000000003 |  | 452.907 |  |
| 48.250000000003 |  | 453.255 |  |
| 48.200000000003 |  | 453.602 |  |
| 48.150000000003 |  | 453.949 |  |
| 48.10000000000301 |  | 454.296 |  |
| 48.05000000000301 |  | 454.643 |  |
| 48.00000000000301 |  | 454.989 |  |
| 47.95000000000302 |  | 455.335 |  |
| 47.90000000000302 |  | 455.682 |  |
| 47.85000000000302 |  | 456.028 |  |
| 47.80000000000302 |  | 456.373 |  |
| 47.75000000000303 |  | 456.719 |  |
| 47.70000000000303 |  | 457.064 |  |
| 47.65000000000303 |  | 457.41 |  |
| 47.60000000000304 |  | 457.755 |  |
| 47.55000000000304 |  | 458.099 |  |
| 47.50000000000304 |  | 458.444 |  |
| 47.45000000000304 |  | 458.789 |  |
| 47.40000000000305 |  | 459.133 |  |
| 47.35000000000305 |  | 459.477 |  |
| 47.30000000000305 |  | 459.821 |  |
| 47.25000000000306 |  | 460.165 |  |
| 47.20000000000306 |  | 460.509 |  |
| 47.15000000000306 |  | 460.852 |  |
| 47.10000000000306 |  | 461.195 |  |
| 47.05000000000307 |  | 461.538 |  |
| 47.00000000000307 |  | 461.881 |  |
| 46.95000000000307 |  | 462.224 |  |
| 46.90000000000308 |  | 462.566 |  |
| 46.85000000000308 |  | 462.909 |  |
| 46.80000000000308 |  | 463.251 |  |
| 46.75000000000308 |  | 463.593 |  |
| 46.70000000000309 |  | 463.935 |  |
| 46.65000000000309 |  | 464.276 |  |
| 46.6000000000031 |  | 464.618 |  |
| 46.5500000000031 |  | 464.959 |  |
| 46.5000000000031 |  | 465.3 |  |
| 46.4500000000031 |  | 465.641 |  |
| 46.4000000000031 |  | 465.981 |  |
| 46.35000000000311 |  | 466.322 |  |
| 46.30000000000311 |  | 466.662 |  |
| 46.25000000000311 |  | 467.002 |  |
| 46.20000000000312 |  | 467.342 |  |
| 46.15000000000312 |  | 467.682 |  |
| 46.10000000000312 |  | 468.022 |  |
| 46.05000000000312 |  | 468.361 |  |
| 46.00000000000313 |  | 468.7 |  |
| 45.95000000000313 |  | 469.039 |  |
| 45.90000000000313 |  | 469.378 |  |
| 45.85000000000313 |  | 469.717 |  |
| 45.80000000000314 |  | 470.055 |  |
| 45.75000000000314 |  | 470.393 |  |
| 45.70000000000314 |  | 470.732 |  |
| 45.65000000000315 |  | 471.069 |  |
| 45.60000000000315 |  | 471.407 |  |
| 45.55000000000315 |  | 471.745 |  |
| 45.50000000000315 |  | 472.082 |  |
| 45.45000000000316 |  | 472.419 |  |
| 45.40000000000316 |  | 472.756 |  |
| 45.35000000000316 |  | 473.093 |  |
| 45.30000000000317 |  | 473.43 |  |
| 45.25000000000317 |  | 473.766 |  |
| 45.20000000000317 |  | 474.102 |  |
| 45.15000000000317 |  | 474.438 |  |
| 45.10000000000318 |  | 474.774 |  |
| 45.05000000000318 |  | 475.11 |  |
| 45.00000000000318 |  | 475.446 |  |
| 44.95000000000319 |  | 475.781 |  |
| 44.90000000000319 |  | 476.116 |  |
| 44.85000000000319 |  | 476.451 |  |
| 44.80000000000319 |  | 476.786 |  |
| 44.7500000000032 |  | 477.12 |  |
| 44.7000000000032 |  | 477.455 |  |
| 44.6500000000032 |  | 477.789 |  |
| 44.60000000000321 |  | 478.123 |  |
| 44.55000000000321 |  | 478.457 |  |
| 44.50000000000321 |  | 478.79 |  |
| 44.45000000000321 |  | 479.124 |  |
| 44.40000000000322 |  | 479.457 |  |
| 44.35000000000322 |  | 479.79 |  |
| 44.30000000000322 |  | 480.123 |  |
| 44.25000000000323 |  | 480.456 |  |
| 44.20000000000323 |  | 480.788 |  |
| 44.15000000000323 |  | 481.12 |  |
| 44.10000000000323 |  | 481.453 |  |
| 44.05000000000324 |  | 481.785 |  |
| 44.00000000000324 |  | 482.116 |  |
| 43.95000000000324 |  | 482.448 |  |
| 43.90000000000325 |  | 482.779 |  |
| 43.85000000000325 |  | 483.11 |  |
| 43.80000000000325 |  | 483.441 |  |
| 43.75000000000325 |  | 483.772 |  |
| 43.70000000000326 |  | 484.103 |  |
| 43.65000000000326 |  | 484.433 |  |
| 43.60000000000326 |  | 484.764 |  |
| 43.55000000000327 |  | 485.094 |  |
| 43.50000000000327 |  | 485.423 |  |
| 43.45000000000327 |  | 485.753 |  |
| 43.40000000000327 |  | 486.083 |  |
| 43.35000000000328 |  | 486.412 |  |
| 43.30000000000328 |  | 486.741 |  |
| 43.25000000000328 |  | 487.07 |  |
| 43.20000000000329 |  | 487.399 |  |
| 43.15000000000329 |  | 487.727 |  |
| 43.1000000000033 |  | 488.056 |  |
| 43.05000000000329 |  | 488.384 |  |
| 43.0000000000033 |  | 488.712 |  |
| 42.9500000000033 |  | 489.039 |  |
| 42.9000000000033 |  | 489.367 |  |
| 42.85000000000331 |  | 489.694 |  |
| 42.80000000000331 |  | 490.022 |  |
| 42.75000000000331 |  | 490.349 |  |
| 42.70000000000331 |  | 490.676 |  |
| 42.65000000000332 |  | 491.002 |  |
| 42.60000000000332 |  | 491.329 |  |
| 42.55000000000332 |  | 491.655 |  |
| 42.50000000000333 |  | 491.981 |  |
| 42.45000000000333 |  | 492.307 |  |
| 42.40000000000333 |  | 492.632 |  |
| 42.35000000000333 |  | 492.958 |  |
| 42.30000000000334 |  | 493.283 |  |
| 42.25000000000334 |  | 493.608 |  |
| 42.20000000000334 |  | 493.933 |  |
| 42.15000000000335 |  | 494.258 |  |
| 42.10000000000335 |  | 494.582 |  |
| 42.05000000000335 |  | 494.907 |  |
| 42.00000000000335 |  | 495.231 |  |
| 41.95000000000336 |  | 495.555 |  |
| 41.90000000000336 |  | 495.879 |  |
| 41.85000000000336 |  | 496.202 |  |
| 41.80000000000337 |  | 496.525 |  |
| 41.75000000000337 |  | 496.849 |  |
| 41.70000000000337 |  | 497.172 |  |
| 41.65000000000337 |  | 497.494 |  |
| 41.60000000000338 |  | 497.817 |  |
| 41.55000000000338 |  | 498.139 |  |
| 41.50000000000338 |  | 498.462 |  |
| 41.45000000000338 |  | 498.784 |  |
| 41.40000000000339 |  | 499.105 |  |
| 41.35000000000339 |  | 499.427 |  |
| 41.30000000000339 |  | 499.748 |  |
| 41.2500000000034 |  | 500.07 |  |
| 41.2000000000034 |  | 500.391 |  |
| 41.1500000000034 |  | 500.712 |  |
| 41.1000000000034 |  | 501.032 |  |
| 41.05000000000341 |  | 501.353 |  |
| 41.00000000000341 |  | 501.673 |  |
| 40.95000000000341 |  | 501.993 |  |
| 40.90000000000342 |  | 502.313 |  |
| 40.85000000000342 |  | 502.632 |  |
| 40.80000000000342 |  | 502.952 |  |
| 40.75000000000342 |  | 503.271 |  |
| 40.70000000000343 |  | 503.59 |  |
| 40.65000000000343 |  | 503.909 |  |
| 40.60000000000343 |  | 504.228 |  |
| 40.55000000000344 |  | 504.546 |  |
| 40.50000000000344 |  | 504.865 |  |
| 40.45000000000344 |  | 505.183 |  |
| 40.40000000000344 |  | 505.501 |  |
| 40.35000000000345 |  | 505.818 |  |
| 40.30000000000345 |  | 506.136 |  |
| 40.25000000000345 |  | 506.453 |  |
| 40.20000000000346 |  | 506.77 |  |
| 40.15000000000346 |  | 507.087 |  |
| 40.10000000000346 |  | 507.404 |  |
| 40.05000000000346 |  | 507.72 |  |
| 40.00000000000347 |  | 508.037 |  |
| 39.95000000000347 |  | 508.353 |  |
| 39.90000000000347 |  | 508.669 |  |
| 39.85000000000348 |  | 508.985 |  |
| 39.80000000000348 |  | 509.3 |  |
| 39.75000000000348 |  | 509.615 |  |
| 39.70000000000348 |  | 509.931 |  |
| 39.65000000000349 |  | 510.246 |  |
| 39.6000000000035 |  | 510.56 |  |
| 39.55000000000349 |  | 510.875 |  |
| 39.5000000000035 |  | 511.189 |  |
| 39.4500000000035 |  | 511.503 |  |
| 39.4000000000035 |  | 511.817 |  |
| 39.3500000000035 |  | 512.131 |  |
| 39.30000000000351 |  | 512.445 |  |
| 39.25000000000351 |  | 512.758 |  |
| 39.20000000000351 |  | 513.071 |  |
| 39.15000000000352 |  | 513.384 |  |
| 39.10000000000352 |  | 513.697 |  |
| 39.05000000000352 |  | 514.009 |  |
| 39.00000000000352 |  | 514.322 |  |
| 38.95000000000353 |  | 514.634 |  |
| 38.90000000000353 |  | 514.946 |  |
| 38.85000000000353 |  | 515.258 |  |
| 38.80000000000354 |  | 515.569 |  |
| 38.75000000000354 |  | 515.88 |  |
| 38.70000000000354 |  | 516.192 |  |
| 38.65000000000354 |  | 516.503 |  |
| 38.60000000000355 |  | 516.813 |  |
| 38.55000000000355 |  | 517.124 |  |
| 38.50000000000355 |  | 517.434 |  |
| 38.45000000000356 |  | 517.744 |  |
| 38.40000000000356 |  | 518.054 |  |
| 38.35000000000356 |  | 518.364 |  |
| 38.30000000000356 |  | 518.674 |  |
| 38.25000000000357 |  | 518.983 |  |
| 38.20000000000357 |  | 519.292 |  |
| 38.15000000000357 |  | 519.601 |  |
| 38.10000000000358 |  | 519.91 |  |
| 38.05000000000358 |  | 520.218 |  |
| 38.00000000000358 |  | 520.526 |  |
| 37.95000000000358 |  | 520.835 |  |
| 37.90000000000359 |  | 521.143 |  |
| 37.85000000000359 |  | 521.45 |  |
| 37.80000000000359 |  | 521.758 |  |
| 37.7500000000036 |  | 522.065 |  |
| 37.7000000000036 |  | 522.372 |  |
| 37.6500000000036 |  | 522.679 |  |
| 37.6000000000036 |  | 522.986 |  |
| 37.55000000000361 |  | 523.292 |  |
| 37.50000000000361 |  | 523.599 |  |
| 37.45000000000361 |  | 523.905 |  |
| 37.40000000000362 |  | 524.21 |  |
| 37.35000000000362 |  | 524.516 |  |
| 37.30000000000362 |  | 524.822 |  |
| 37.25000000000362 |  | 525.127 |  |
| 37.20000000000363 |  | 525.432 |  |
| 37.15000000000363 |  | 525.737 |  |
| 37.10000000000363 |  | 526.041 |  |
| 37.05000000000364 |  | 526.346 |  |
| 37.00000000000364 |  | 526.65 |  |
| 36.95000000000364 |  | 526.954 |  |
| 36.90000000000364 |  | 527.258 |  |
| 36.85000000000365 |  | 527.562 |  |
| 36.80000000000365 |  | 527.865 |  |
| 36.75000000000365 |  | 528.168 |  |
| 36.70000000000365 |  | 528.471 |  |
| 36.65000000000366 |  | 528.774 |  |
| 36.60000000000366 |  | 529.077 |  |
| 36.55000000000366 |  | 529.379 |  |
| 36.50000000000367 |  | 529.681 |  |
| 36.45000000000367 |  | 529.983 |  |
| 36.40000000000367 |  | 530.285 |  |
| 36.35000000000367 |  | 530.587 |  |
| 36.30000000000368 |  | 530.888 |  |
| 36.25000000000368 |  | 531.189 |  |
| 36.20000000000368 |  | 531.49 |  |
| 36.15000000000369 |  | 531.791 |  |
| 36.10000000000369 |  | 532.091 |  |
| 36.05000000000369 |  | 532.392 |  |
| 36.00000000000369 |  | 532.692 |  |
| 35.9500000000037 |  | 532.992 |  |
| 35.9000000000037 |  | 533.291 |  |
| 35.8500000000037 |  | 533.591 |  |
| 35.80000000000371 |  | 533.89 |  |
| 35.75000000000371 |  | 534.189 |  |
| 35.70000000000371 |  | 534.488 |  |
| 35.65000000000371 |  | 534.787 |  |
| 35.60000000000372 |  | 535.085 |  |
| 35.55000000000372 |  | 535.383 |  |
| 35.50000000000372 |  | 535.681 |  |
| 35.45000000000373 |  | 535.979 |  |
| 35.40000000000373 |  | 536.277 |  |
| 35.35000000000373 |  | 536.574 |  |
| 35.30000000000373 |  | 536.871 |  |
| 35.25000000000374 |  | 537.168 |  |
| 35.20000000000374 |  | 537.465 |  |
| 35.15000000000374 |  | 537.761 |  |
| 35.10000000000374 |  | 538.058 |  |
| 35.05000000000375 |  | 538.354 |  |
| 35.00000000000375 |  | 538.65 |  |
| 34.95000000000375 |  | 538.945 |  |
| 34.90000000000376 |  | 539.241 |  |
| 34.85000000000376 |  | 539.536 |  |
| 34.80000000000376 |  | 539.831 |  |
| 34.75000000000377 |  | 540.126 |  |
| 34.70000000000377 |  | 540.421 |  |
| 34.65000000000377 |  | 540.715 |  |
| 34.60000000000377 |  | 541.009 |  |
| 34.55000000000378 |  | 541.303 |  |
| 34.50000000000378 |  | 541.597 |  |
| 34.45000000000378 |  | 541.891 |  |
| 34.40000000000379 |  | 542.184 |  |
| 34.35000000000379 |  | 542.477 |  |
| 34.3000000000038 |  | 542.77 |  |
| 34.2500000000038 |  | 543.063 |  |
| 34.2000000000038 |  | 543.355 |  |
| 34.1500000000038 |  | 543.648 |  |
| 34.1000000000038 |  | 543.94 |  |
| 34.05000000000381 |  | 544.232 |  |
| 34.00000000000381 |  | 544.523 |  |
| 33.95000000000381 |  | 544.815 |  |
| 33.90000000000381 |  | 545.106 |  |
| 33.85000000000382 |  | 545.397 |  |
| 33.80000000000382 |  | 545.688 |  |
| 33.75000000000382 |  | 545.978 |  |
| 33.70000000000382 |  | 546.269 |  |
| 33.65000000000383 |  | 546.559 |  |
| 33.60000000000383 |  | 546.849 |  |
| 33.55000000000383 |  | 547.139 |  |
| 33.50000000000384 |  | 547.428 |  |
| 33.45000000000384 |  | 547.717 |  |
| 33.40000000000384 |  | 548.006 |  |
| 33.35000000000385 |  | 548.295 |  |
| 33.30000000000385 |  | 548.584 |  |
| 33.25000000000385 |  | 548.872 |  |
| 33.20000000000385 |  | 549.161 |  |
| 33.15000000000386 |  | 549.449 |  |
| 33.10000000000386 |  | 549.736 |  |
| 33.05000000000386 |  | 550.024 |  |
| 33.00000000000387 |  | 550.311 |  |
| 32.95000000000387 |  | 550.598 |  |
| 32.90000000000387 |  | 550.885 |  |
| 32.85000000000387 |  | 551.172 |  |
| 32.80000000000388 |  | 551.458 |  |
| 32.75000000000388 |  | 551.745 |  |
| 32.70000000000388 |  | 552.031 |  |
| 32.65000000000389 |  | 552.317 |  |
| 32.60000000000389 |  | 552.602 |  |
| 32.5500000000039 |  | 552.887 |  |
| 32.5000000000039 |  | 553.173 |  |
| 32.4500000000039 |  | 553.458 |  |
| 32.4000000000039 |  | 553.742 |  |
| 32.3500000000039 |  | 554.027 |  |
| 32.30000000000391 |  | 554.311 |  |
| 32.25000000000391 |  | 554.595 |  |
| 32.20000000000391 |  | 554.879 |  |
| 32.15000000000391 |  | 555.163 |  |
| 32.10000000000392 |  | 555.446 |  |
| 32.05000000000392 |  | 555.729 |  |
| 32.00000000000392 |  | 556.012 |  |
| 31.95000000000392 |  | 556.295 |  |
| 31.90000000000392 |  | 556.577 |  |
| 31.85000000000392 |  | 556.86 |  |
| 31.80000000000392 |  | 557.142 |  |
| 31.75000000000392 |  | 557.424 |  |
| 31.70000000000392 |  | 557.705 |  |
| 31.65000000000392 |  | 557.987 |  |
| 31.60000000000392 |  | 558.268 |  |
| 31.55000000000392 |  | 558.549 |  |
| 31.50000000000392 |  | 558.829 |  |
| 31.45000000000391 |  | 559.11 |  |
| 31.40000000000391 |  | 559.39 |  |
| 31.35000000000391 |  | 559.67 |  |
| 31.30000000000391 |  | 559.95 |  |
| 31.25000000000391 |  | 560.23 |  |
| 31.20000000000391 |  | 560.509 |  |
| 31.15000000000391 |  | 560.788 |  |
| 31.10000000000391 |  | 561.067 |  |
| 31.05000000000391 |  | 561.346 |  |
| 31.00000000000391 |  | 561.624 |  |
| 30.95000000000391 |  | 561.903 |  |
| 30.90000000000391 |  | 562.181 |  |
| 30.85000000000391 |  | 562.459 |  |
| 30.80000000000391 |  | 562.736 |  |
| 30.7500000000039 |  | 563.014 |  |
| 30.7000000000039 |  | 563.291 |  |
| 30.6500000000039 |  | 563.568 |  |
| 30.6000000000039 |  | 563.844 |  |
| 30.5500000000039 |  | 564.121 |  |
| 30.5000000000039 |  | 564.397 |  |
| 30.4500000000039 |  | 564.673 |  |
| 30.4000000000039 |  | 564.949 |  |
| 30.3500000000039 |  | 565.225 |  |
| 30.3000000000039 |  | 565.5 |  |
| 30.2500000000039 |  | 565.775 |  |
| 30.2000000000039 |  | 566.05 |  |
| 30.1500000000039 |  | 566.325 |  |
| 30.1000000000039 |  | 566.599 |  |
| 30.05000000000389 |  | 566.873 |  |
| 30.00000000000389 |  | 567.147 |  |
| 29.95000000000389 |  | 567.421 |  |
| 29.90000000000389 |  | 567.694 |  |
| 29.85000000000389 |  | 567.968 |  |
| 29.80000000000389 |  | 568.241 |  |
| 29.75000000000389 |  | 568.514 |  |
| 29.70000000000389 |  | 568.786 |  |
| 29.65000000000389 |  | 569.059 |  |
| 29.60000000000389 |  | 569.331 |  |
| 29.55000000000389 |  | 569.603 |  |
| 29.50000000000389 |  | 569.874 |  |
| 29.45000000000389 |  | 570.146 |  |
| 29.40000000000389 |  | 570.417 |  |
| 29.35000000000388 |  | 570.688 |  |
| 29.30000000000388 |  | 570.959 |  |
| 29.25000000000388 |  | 571.229 |  |
| 29.20000000000388 |  | 571.5 |  |
| 29.15000000000388 |  | 571.77 |  |
| 29.10000000000388 |  | 572.039 |  |
| 29.05000000000388 |  | 572.309 |  |
| 29.00000000000388 |  | 572.578 |  |
| 28.95000000000388 |  | 572.848 |  |
| 28.90000000000388 |  | 573.116 |  |
| 28.85000000000388 |  | 573.385 |  |
| 28.80000000000388 |  | 573.654 |  |
| 28.75000000000388 |  | 573.922 |  |
| 28.70000000000388 |  | 574.19 |  |
| 28.65000000000387 |  | 574.458 |  |
| 28.60000000000387 |  | 574.725 |  |
| 28.55000000000387 |  | 574.992 |  |
| 28.50000000000387 |  | 575.259 |  |
| 28.45000000000387 |  | 575.526 |  |
| 28.40000000000387 |  | 575.793 |  |
| 28.35000000000387 |  | 576.059 |  |
| 28.30000000000387 |  | 576.325 |  |
| 28.25000000000387 |  | 576.591 |  |
| 28.20000000000387 |  | 576.857 |  |
| 28.15000000000387 |  | 577.122 |  |
| 28.10000000000387 |  | 577.387 |  |
| 28.05000000000387 |  | 577.652 |  |
| 28.00000000000387 |  | 577.917 |  |
| 27.95000000000386 |  | 578.181 |  |
| 27.90000000000386 |  | 578.446 |  |
| 27.85000000000386 |  | 578.71 |  |
| 27.80000000000386 |  | 578.973 |  |
| 27.75000000000386 |  | 579.237 |  |
| 27.70000000000386 |  | 579.5 |  |
| 27.65000000000386 |  | 579.763 |  |
| 27.60000000000386 |  | 580.026 |  |
| 27.55000000000386 |  | 580.288 |  |
| 27.50000000000386 |  | 580.551 |  |
| 27.45000000000386 |  | 580.813 |  |
| 27.40000000000386 |  | 581.075 |  |
| 27.35000000000386 |  | 581.336 |  |
| 27.30000000000386 |  | 581.598 |  |
| 27.25000000000385 |  | 581.859 |  |
| 27.20000000000385 |  | 582.12 |  |
| 27.15000000000385 |  | 582.38 |  |
| 27.10000000000385 |  | 582.641 |  |
| 27.05000000000385 |  | 582.901 |  |
| 27.00000000000385 |  | 583.161 |  |
| 26.95000000000385 |  | 583.421 |  |
| 26.90000000000385 |  | 583.68 |  |
| 26.85000000000385 |  | 583.939 |  |
| 26.80000000000385 |  | 584.198 |  |
| 26.75000000000385 |  | 584.457 |  |
| 26.70000000000385 |  | 584.715 |  |
| 26.65000000000385 |  | 584.974 |  |
| 26.60000000000385 |  | 585.232 |  |
| 26.55000000000384 |  | 585.489 |  |
| 26.50000000000384 |  | 585.747 |  |
| 26.45000000000384 |  | 586.004 |  |
| 26.40000000000384 |  | 586.261 |  |
| 26.35000000000384 |  | 586.518 |  |
| 26.30000000000384 |  | 586.775 |  |
| 26.25000000000384 |  | 587.031 |  |
| 26.20000000000384 |  | 587.287 |  |
| 26.15000000000384 |  | 587.543 |  |
| 26.10000000000384 |  | 587.798 |  |
| 26.05000000000384 |  | 588.054 |  |
| 26.00000000000384 |  | 588.309 |  |
| 25.95000000000384 |  | 588.563 |  |
| 25.90000000000384 |  | 588.818 |  |
| 25.85000000000383 |  | 589.072 |  |
| 25.80000000000383 |  | 589.326 |  |
| 25.75000000000383 |  | 589.58 |  |
| 25.70000000000383 |  | 589.834 |  |
| 25.65000000000383 |  | 590.087 |  |
| 25.60000000000383 |  | 590.34 |  |
| 25.55000000000383 |  | 590.593 |  |
| 25.50000000000383 |  | 590.846 |  |
| 25.45000000000383 |  | 591.098 |  |
| 25.40000000000383 |  | 591.35 |  |
| 25.35000000000383 |  | 591.602 |  |
| 25.30000000000383 |  | 591.854 |  |
| 25.25000000000383 |  | 592.105 |  |
| 25.20000000000383 |  | 592.356 |  |
| 25.15000000000382 |  | 592.607 |  |
| 25.10000000000382 |  | 592.858 |  |
| 25.05000000000382 |  | 593.108 |  |
| 25.00000000000382 |  | 593.358 |  |
| 24.95000000000382 |  | 593.608 |  |
| 24.90000000000382 |  | 593.858 |  |
| 24.85000000000382 |  | 594.107 |  |
| 24.80000000000382 |  | 594.356 |  |
| 24.75000000000382 |  | 594.605 |  |
| 24.70000000000382 |  | 594.854 |  |
| 24.65000000000382 |  | 595.102 |  |
| 24.60000000000382 |  | 595.35 |  |
| 24.55000000000382 |  | 595.598 |  |
| 24.50000000000382 |  | 595.846 |  |
| 24.45000000000381 |  | 596.093 |  |
| 24.40000000000381 |  | 596.34 |  |
| 24.35000000000381 |  | 596.587 |  |
| 24.30000000000381 |  | 596.834 |  |
| 24.25000000000381 |  | 597.08 |  |
| 24.20000000000381 |  | 597.326 |  |
| 24.15000000000381 |  | 597.572 |  |
| 24.10000000000381 |  | 597.818 |  |
| 24.05000000000381 |  | 598.063 |  |
| 24.00000000000381 |  | 598.308 |  |
| 23.95000000000381 |  | 598.553 |  |
| 23.90000000000381 |  | 598.797 |  |
| 23.85000000000381 |  | 599.042 |  |
| 23.80000000000381 |  | 599.286 |  |
| 23.7500000000038 |  | 599.53 |  |
| 23.7000000000038 |  | 599.773 |  |
| 23.6500000000038 |  | 600.016 |  |
| 23.6000000000038 |  | 600.259 |  |
| 23.5500000000038 |  | 600.502 |  |
| 23.5000000000038 |  | 600.745 |  |
| 23.4500000000038 |  | 600.987 |  |
| 23.4000000000038 |  | 601.229 |  |
| 23.3500000000038 |  | 601.471 |  |
| 23.3000000000038 |  | 601.712 |  |
| 23.2500000000038 |  | 601.953 |  |
| 23.2000000000038 |  | 602.194 |  |
| 23.1500000000038 |  | 602.435 |  |
| 23.1000000000038 |  | 602.675 |  |
| 23.05000000000379 |  | 602.916 |  |
| 23.00000000000379 |  | 603.156 |  |
| 22.95000000000379 |  | 603.395 |  |
| 22.90000000000379 |  | 603.635 |  |
| 22.85000000000379 |  | 603.874 |  |
| 22.80000000000379 |  | 604.113 |  |
| 22.75000000000379 |  | 604.351 |  |
| 22.70000000000379 |  | 604.59 |  |
| 22.65000000000379 |  | 604.828 |  |
| 22.60000000000379 |  | 605.066 |  |
| 22.55000000000379 |  | 605.303 |  |
| 22.50000000000379 |  | 605.54 |  |
| 22.45000000000379 |  | 605.777 |  |
| 22.40000000000379 |  | 606.014 |  |
| 22.35000000000379 |  | 606.251 |  |
| 22.30000000000378 |  | 606.487 |  |
| 22.25000000000378 |  | 606.723 |  |
| 22.20000000000378 |  | 606.959 |  |
| 22.15000000000378 |  | 607.194 |  |
| 22.10000000000378 |  | 607.429 |  |
| 22.05000000000378 |  | 607.664 |  |
| 22.00000000000378 |  | 607.899 |  |
| 21.95000000000378 |  | 608.133 |  |
| 21.90000000000378 |  | 608.367 |  |
| 21.85000000000378 |  | 608.601 |  |
| 21.80000000000378 |  | 608.835 |  |
| 21.75000000000378 |  | 609.068 |  |
| 21.70000000000378 |  | 609.301 |  |
| 21.65000000000378 |  | 609.534 |  |
| 21.60000000000377 |  | 609.766 |  |
| 21.55000000000377 |  | 609.999 |  |
| 21.50000000000377 |  | 610.231 |  |
| 21.45000000000377 |  | 610.462 |  |
| 21.40000000000377 |  | 610.694 |  |
| 21.35000000000377 |  | 610.925 |  |
| 21.30000000000377 |  | 611.156 |  |
| 21.25000000000377 |  | 611.387 |  |
| 21.20000000000377 |  | 611.617 |  |
| 21.15000000000377 |  | 611.847 |  |
| 21.10000000000377 |  | 612.077 |  |
| 21.05000000000377 |  | 612.306 |  |
| 21.00000000000377 |  | 612.536 |  |
| 20.95000000000377 |  | 612.765 |  |
| 20.90000000000376 |  | 612.993 |  |
| 20.85000000000376 |  | 613.222 |  |
| 20.80000000000376 |  | 613.45 |  |
| 20.75000000000376 |  | 613.678 |  |
| 20.70000000000376 |  | 613.905 |  |
| 20.65000000000376 |  | 614.133 |  |
| 20.60000000000376 |  | 614.36 |  |
| 20.55000000000376 |  | 614.587 |  |
| 20.50000000000376 |  | 614.813 |  |
| 20.45000000000376 |  | 615.039 |  |
| 20.40000000000376 |  | 615.265 |  |
| 20.35000000000376 |  | 615.491 |  |
| 20.30000000000376 |  | 615.716 |  |
| 20.25000000000376 |  | 615.942 |  |
| 20.20000000000375 |  | 616.166 |  |
| 20.15000000000375 |  | 616.391 |  |
| 20.10000000000375 |  | 616.615 |  |
| 20.05000000000375 |  | 616.839 |  |
| 20.00000000000375 |  | 617.063 |  |
| 19.95000000000375 |  | 617.287 |  |
| 19.90000000000375 |  | 617.51 |  |
| 19.85000000000375 |  | 617.733 |  |
| 19.80000000000375 |  | 617.955 |  |
| 19.75000000000375 |  | 618.178 |  |
| 19.70000000000375 |  | 618.4 |  |
| 19.65000000000375 |  | 618.622 |  |
| 19.60000000000375 |  | 618.843 |  |
| 19.55000000000375 |  | 619.064 |  |
| 19.50000000000374 |  | 619.285 |  |
| 19.45000000000374 |  | 619.506 |  |
| 19.40000000000374 |  | 619.726 |  |
| 19.35000000000374 |  | 619.946 |  |
| 19.30000000000374 |  | 620.166 |  |
| 19.25000000000374 |  | 620.386 |  |
| 19.20000000000374 |  | 620.605 |  |
| 19.15000000000374 |  | 620.824 |  |
| 19.10000000000374 |  | 621.042 |  |
| 19.05000000000374 |  | 621.261 |  |
| 19.00000000000374 |  | 621.479 |  |
| 18.95000000000374 |  | 621.697 |  |
| 18.90000000000374 |  | 621.914 |  |
| 18.85000000000374 |  | 622.131 |  |
| 18.80000000000373 |  | 622.348 |  |
| 18.75000000000373 |  | 622.565 |  |
| 18.70000000000373 |  | 622.781 |  |
| 18.65000000000373 |  | 622.997 |  |
| 18.60000000000373 |  | 623.213 |  |
| 18.55000000000373 |  | 623.429 |  |
| 18.50000000000373 |  | 623.644 |  |
| 18.45000000000373 |  | 623.859 |  |
| 18.40000000000373 |  | 624.073 |  |
| 18.35000000000373 |  | 624.288 |  |
| 18.30000000000373 |  | 624.502 |  |
| 18.25000000000373 |  | 624.716 |  |
| 18.20000000000373 |  | 624.929 |  |
| 18.15000000000373 |  | 625.142 |  |
| 18.10000000000372 |  | 625.355 |  |
| 18.05000000000372 |  | 625.568 |  |
| 18.00000000000372 |  | 625.78 |  |
| 17.95000000000372 |  | 625.992 |  |
| 17.90000000000372 |  | 626.204 |  |
| 17.85000000000372 |  | 626.415 |  |
| 17.80000000000372 |  | 626.626 |  |
| 17.75000000000372 |  | 626.837 |  |
| 17.70000000000372 |  | 627.047 |  |
| 17.65000000000372 |  | 627.258 |  |
| 17.60000000000372 |  | 627.468 |  |
| 17.55000000000372 |  | 627.677 |  |
| 17.50000000000372 |  | 627.886 |  |
| 17.45000000000372 |  | 628.095 |  |
| 17.40000000000371 |  | 628.304 |  |
| 17.35000000000371 |  | 628.513 |  |
| 17.30000000000371 |  | 628.721 |  |
| 17.25000000000371 |  | 628.929 |  |
| 17.20000000000371 |  | 629.136 |  |
| 17.15000000000371 |  | 629.343 |  |
| 17.10000000000371 |  | 629.55 |  |
| 17.05000000000371 |  | 629.757 |  |
| 17.00000000000371 |  | 629.963 |  |
| 16.95000000000371 |  | 630.169 |  |
| 16.90000000000371 |  | 630.375 |  |
| 16.85000000000371 |  | 630.58 |  |
| 16.80000000000371 |  | 630.785 |  |
| 16.75000000000371 |  | 630.99 |  |
| 16.7000000000037 |  | 631.195 |  |
| 16.6500000000037 |  | 631.399 |  |
| 16.6000000000037 |  | 631.603 |  |
| 16.5500000000037 |  | 631.806 |  |
| 16.5000000000037 |  | 632.009 |  |
| 16.4500000000037 |  | 632.212 |  |
| 16.4000000000037 |  | 632.415 |  |
| 16.3500000000037 |  | 632.617 |  |
| 16.3000000000037 |  | 632.819 |  |
| 16.2500000000037 |  | 633.021 |  |
| 16.2000000000037 |  | 633.222 |  |
| 16.1500000000037 |  | 633.424 |  |
| 16.1000000000037 |  | 633.624 |  |
| 16.0500000000037 |  | 633.825 |  |
| 16.00000000000369 |  | 634.025 |  |
| 15.95000000000369 |  | 634.225 |  |
| 15.90000000000369 |  | 634.424 |  |
| 15.8500000000037 |  | 634.624 |  |
| 15.8000000000037 |  | 634.822 |  |
| 15.7500000000037 |  | 635.021 |  |
| 15.7000000000037 |  | 635.219 |  |
| 15.65000000000369 |  | 635.417 |  |
| 15.60000000000369 |  | 635.615 |  |
| 15.55000000000369 |  | 635.812 |  |
| 15.50000000000369 |  | 636.009 |  |
| 15.45000000000369 |  | 636.206 |  |
| 15.40000000000369 |  | 636.402 |  |
| 15.35000000000369 |  | 636.598 |  |
| 15.30000000000368 |  | 636.794 |  |
| 15.25000000000368 |  | 636.99 |  |
| 15.20000000000368 |  | 637.185 |  |
| 15.15000000000368 |  | 637.379 |  |
| 15.10000000000368 |  | 637.574 |  |
| 15.05000000000368 |  | 637.768 |  |
| 15.00000000000368 |  | 637.962 |  |
| 14.95000000000368 |  | 638.155 |  |
| 14.90000000000368 |  | 638.348 |  |
| 14.85000000000368 |  | 638.541 |  |
| 14.80000000000368 |  | 638.734 |  |
| 14.75000000000368 |  | 638.926 |  |
| 14.70000000000368 |  | 639.118 |  |
| 14.65000000000368 |  | 639.309 |  |
| 14.60000000000367 |  | 639.501 |  |
| 14.55000000000367 |  | 639.691 |  |
| 14.50000000000367 |  | 639.882 |  |
| 14.45000000000367 |  | 640.072 |  |
| 14.40000000000367 |  | 640.262 |  |
| 14.35000000000367 |  | 640.452 |  |
| 14.30000000000367 |  | 640.641 |  |
| 14.25000000000367 |  | 640.83 |  |
| 14.20000000000367 |  | 641.018 |  |
| 14.15000000000367 |  | 641.207 |  |
| 14.10000000000367 |  | 641.395 |  |
| 14.05000000000367 |  | 641.582 |  |
| 14.00000000000367 |  | 641.769 |  |
| 13.95000000000367 |  | 641.956 |  |
| 13.90000000000366 |  | 642.143 |  |
| 13.85000000000366 |  | 642.329 |  |
| 13.80000000000366 |  | 642.515 |  |
| 13.75000000000366 |  | 642.701 |  |
| 13.70000000000366 |  | 642.886 |  |
| 13.65000000000366 |  | 643.071 |  |
| 13.60000000000366 |  | 643.255 |  |
| 13.55000000000366 |  | 643.44 |  |
| 13.50000000000366 |  | 643.624 |  |
| 13.45000000000366 |  | 643.807 |  |
| 13.40000000000366 |  | 643.99 |  |
| 13.35000000000366 |  | 644.173 |  |
| 13.30000000000366 |  | 644.356 |  |
| 13.25000000000366 |  | 644.538 |  |
| 13.20000000000366 |  | 644.72 |  |
| 13.15000000000365 |  | 644.901 |  |
| 13.10000000000365 |  | 645.082 |  |
| 13.05000000000365 |  | 645.263 |  |
| 13.00000000000365 |  | 645.444 |  |
| 12.95000000000365 |  | 645.624 |  |
| 12.90000000000365 |  | 645.803 |  |
| 12.85000000000365 |  | 645.983 |  |
| 12.80000000000365 |  | 646.162 |  |
| 12.75000000000365 |  | 646.341 |  |
| 12.70000000000365 |  | 646.519 |  |
| 12.65000000000365 |  | 646.697 |  |
| 12.60000000000365 |  | 646.875 |  |
| 12.55000000000365 |  | 647.052 |  |
| 12.50000000000365 |  | 647.229 |  |
| 12.45000000000364 |  | 647.405 |  |
| 12.40000000000364 |  | 647.582 |  |
| 12.35000000000364 |  | 647.758 |  |
| 12.30000000000364 |  | 647.933 |  |
| 12.25000000000364 |  | 648.108 |  |
| 12.20000000000364 |  | 648.283 |  |
| 12.15000000000364 |  | 648.458 |  |
| 12.10000000000364 |  | 648.632 |  |
| 12.05000000000364 |  | 648.805 |  |
| 12.00000000000364 |  | 648.979 |  |
| 11.95000000000364 |  | 649.152 |  |
| 11.90000000000364 |  | 649.324 |  |
| 11.85000000000364 |  | 649.497 |  |
| 11.80000000000364 |  | 649.669 |  |
| 11.75000000000363 |  | 649.84 |  |
| 11.70000000000363 |  | 650.012 |  |
| 11.65000000000363 |  | 650.182 |  |
| 11.60000000000363 |  | 650.353 |  |
| 11.55000000000363 |  | 650.523 |  |
| 11.50000000000363 |  | 650.693 |  |
| 11.45000000000363 |  | 650.862 |  |
| 11.40000000000363 |  | 651.031 |  |
| 11.35000000000363 |  | 651.2 |  |
| 11.30000000000363 |  | 651.368 |  |
| 11.25000000000363 |  | 651.536 |  |
| 11.20000000000363 |  | 651.703 |  |
| 11.15000000000363 |  | 651.871 |  |
| 11.10000000000363 |  | 652.037 |  |
| 11.05000000000362 |  | 652.204 |  |
| 11.00000000000362 |  | 652.37 |  |
| 10.95000000000362 |  | 652.535 |  |
| 10.90000000000362 |  | 652.701 |  |
| 10.85000000000362 |  | 652.866 |  |
| 10.80000000000362 |  | 653.03 |  |
| 10.75000000000362 |  | 653.194 |  |
| 10.70000000000362 |  | 653.358 |  |
| 10.65000000000362 |  | 653.521 |  |
| 10.60000000000362 |  | 653.684 |  |
| 10.55000000000362 |  | 653.847 |  |
| 10.50000000000362 |  | 654.009 |  |
| 10.45000000000362 |  | 654.171 |  |
| 10.40000000000362 |  | 654.332 |  |
| 10.35000000000361 |  | 654.493 |  |
| 10.30000000000361 |  | 654.654 |  |
| 10.25000000000361 |  | 654.814 |  |
| 10.20000000000361 |  | 654.974 |  |
| 10.15000000000361 |  | 655.134 |  |
| 10.10000000000361 |  | 655.293 |  |
| 10.05000000000361 |  | 655.451 |  |
| 10.00000000000361 |  | 655.61 |  |
| 9.950000000003609 |  | 655.768 |  |
| 9.900000000003608 |  | 655.925 |  |
| 9.850000000003607 |  | 656.082 |  |
| 9.800000000003607 |  | 656.239 |  |
| 9.750000000003604 |  | 656.395 |  |
| 9.700000000003605 |  | 656.551 |  |
| 9.650000000003605 |  | 656.707 |  |
| 9.600000000003604 |  | 656.862 |  |
| 9.550000000003603 |  | 657.017 |  |
| 9.500000000003602 |  | 657.171 |  |
| 9.4500000000036 |  | 657.325 |  |
| 9.4000000000036 |  | 657.478 |  |
| 9.3500000000036 |  | 657.631 |  |
| 9.3000000000036 |  | 657.784 |  |
| 9.250000000003597 |  | 657.936 |  |
| 9.200000000003598 |  | 658.088 |  |
| 9.150000000003597 |  | 658.24 |  |
| 9.100000000003597 |  | 658.391 |  |
| 9.050000000003596 |  | 658.541 |  |
| 9.000000000003595 |  | 658.692 |  |
| 8.950000000003595 |  | 658.841 |  |
| 8.900000000003592 |  | 658.991 |  |
| 8.850000000003593 |  | 659.14 |  |
| 8.800000000003593 |  | 659.288 |  |
| 8.750000000003592 |  | 659.436 |  |
| 8.700000000003591 |  | 659.584 |  |
| 8.65000000000359 |  | 659.731 |  |
| 8.60000000000359 |  | 659.878 |  |
| 8.550000000003587 |  | 660.025 |  |
| 8.500000000003588 |  | 660.171 |  |
| 8.450000000003588 |  | 660.316 |  |
| 8.400000000003587 |  | 660.461 |  |
| 8.350000000003586 |  | 660.606 |  |
| 8.300000000003585 |  | 660.75 |  |
| 8.250000000003585 |  | 660.894 |  |
| 8.200000000003584 |  | 661.037 |  |
| 8.150000000003583 |  | 661.18 |  |
| 8.100000000003583 |  | 661.323 |  |
| 8.050000000003582 |  | 661.465 |  |
| 8.000000000003581 |  | 661.607 |  |
| 7.950000000003581 |  | 661.748 |  |
| 7.900000000003581 |  | 661.889 |  |
| 7.850000000003582 |  | 662.029 |  |
| 7.800000000003582 |  | 662.169 |  |
| 7.750000000003582 |  | 662.308 |  |
| 7.700000000003582 |  | 662.447 |  |
| 7.650000000003582 |  | 662.586 |  |
| 7.600000000003582 |  | 662.724 |  |
| 7.550000000003583 |  | 662.861 |  |
| 7.500000000003583 |  | 662.999 |  |
| 7.450000000003583 |  | 663.135 |  |
| 7.400000000003583 |  | 663.272 |  |
| 7.350000000003583 |  | 663.407 |  |
| 7.300000000003584 |  | 663.543 |  |
| 7.250000000003584 |  | 663.677 |  |
| 7.200000000003584 |  | 663.812 |  |
| 7.150000000003584 |  | 663.946 |  |
| 7.100000000003584 |  | 664.079 |  |
| 7.050000000003584 |  | 664.212 |  |
| 7.000000000003584 |  | 664.345 |  |
| 6.950000000003584 |  | 664.477 |  |
| 6.900000000003585 |  | 664.608 |  |
| 6.850000000003585 |  | 664.74 |  |
| 6.800000000003585 |  | 664.87 |  |
| 6.750000000003585 |  | 665 |  |
| 6.700000000003585 |  | 665.13 |  |
| 6.650000000003586 |  | 665.259 |  |
| 6.600000000003586 |  | 665.388 |  |
| 6.550000000003586 |  | 665.516 |  |
| 6.500000000003586 |  | 665.644 |  |
| 6.450000000003586 |  | 665.771 |  |
| 6.400000000003586 |  | 665.898 |  |
| 6.350000000003587 |  | 666.024 |  |
| 6.300000000003587 |  | 666.15 |  |
| 6.250000000003587 |  | 666.275 |  |
| 6.200000000003587 |  | 666.4 |  |
| 6.150000000003588 |  | 666.524 |  |
| 6.100000000003588 |  | 666.648 |  |
| 6.050000000003588 |  | 666.771 |  |
| 6.000000000003588 |  | 666.894 |  |
| 5.950000000003588 |  | 667.016 |  |
| 5.900000000003588 |  | 667.138 |  |
| 5.850000000003589 |  | 667.259 |  |
| 5.800000000003589 |  | 667.379 |  |
| 5.75000000000359 |  | 667.5 |  |
| 5.70000000000359 |  | 667.619 |  |
| 5.650000000003589 |  | 667.738 |  |
| 5.60000000000359 |  | 667.857 |  |
| 5.55000000000359 |  | 667.975 |  |
| 5.50000000000359 |  | 668.093 |  |
| 5.45000000000359 |  | 668.21 |  |
| 5.40000000000359 |  | 668.326 |  |
| 5.35000000000359 |  | 668.442 |  |
| 5.300000000003591 |  | 668.557 |  |
| 5.250000000003591 |  | 668.672 |  |
| 5.200000000003591 |  | 668.786 |  |
| 5.150000000003591 |  | 668.9 |  |
| 5.100000000003591 |  | 669.013 |  |
| 5.050000000003592 |  | 669.126 |  |
| 5.000000000003592 |  | 669.238 |  |
| 4.950000000003592 |  | 669.35 |  |
| 4.900000000003592 |  | 669.461 |  |
| 4.850000000003592 |  | 669.571 |  |
| 4.800000000003592 |  | 669.681 |  |
| 4.750000000003593 |  | 669.79 |  |
| 4.700000000003593 |  | 669.899 |  |
| 4.650000000003593 |  | 670.007 |  |
| 4.600000000003593 |  | 670.114 |  |
| 4.550000000003593 |  | 670.221 |  |
| 4.500000000003594 |  | 670.328 |  |
| 4.450000000003594 |  | 670.433 |  |
| 4.400000000003594 |  | 670.539 |  |
| 4.350000000003594 |  | 670.643 |  |
| 4.300000000003594 |  | 670.747 |  |
| 4.250000000003594 |  | 670.851 |  |
| 4.200000000003594 |  | 670.953 |  |
| 4.150000000003595 |  | 671.055 |  |
| 4.100000000003595 |  | 671.157 |  |
| 4.050000000003595 |  | 671.258 |  |
| 4.000000000003595 |  | 671.358 |  |
| 3.950000000003595 |  | 671.458 |  |
| 3.900000000003596 |  | 671.557 |  |
| 3.850000000003596 |  | 671.655 |  |
| 3.800000000003596 |  | 671.753 |  |
| 3.750000000003596 |  | 671.85 |  |
| 3.700000000003596 |  | 671.947 |  |
| 3.650000000003596 |  | 672.043 |  |
| 3.600000000003597 |  | 672.138 |  |
| 3.550000000003597 |  | 672.232 |  |
| 3.500000000003597 |  | 672.326 |  |
| 3.450000000003597 |  | 672.42 |  |
| 3.400000000003597 |  | 672.512 |  |
| 3.350000000003598 |  | 672.604 |  |
| 3.300000000003598 |  | 672.695 |  |
| 3.250000000003598 |  | 672.786 |  |
| 3.200000000003598 |  | 672.875 |  |
| 3.150000000003598 |  | 672.964 |  |
| 3.100000000003599 |  | 673.053 |  |
| 3.050000000003599 |  | 673.141 |  |
| 3.000000000003599 |  | 673.228 |  |
| 2.950000000003599 |  | 673.314 |  |
| 2.900000000003599 |  | 673.399 |  |
| 2.850000000003599 |  | 673.484 |  |
| 2.8000000000036 |  | 673.568 |  |
| 2.7500000000036 |  | 673.651 |  |
| 2.7000000000036 |  | 673.734 |  |
| 2.6500000000036 |  | 673.816 |  |
| 2.6000000000036 |  | 673.897 |  |
| 2.5500000000036 |  | 673.977 |  |
| 2.500000000003601 |  | 674.056 |  |
| 2.450000000003601 |  | 674.135 |  |
| 2.400000000003601 |  | 674.213 |  |
| 2.350000000003601 |  | 674.29 |  |
| 2.300000000003601 |  | 674.366 |  |
| 2.250000000003602 |  | 674.442 |  |
| 2.200000000003602 |  | 674.516 |  |
| 2.150000000003602 |  | 674.59 |  |
| 2.100000000003602 |  | 674.663 |  |
| 2.050000000003602 |  | 674.735 |  |
| 2.000000000003602 |  | 674.806 |  |
| 1.950000000003602 |  | 674.876 |  |
| 1.900000000003602 |  | 674.946 |  |
| 1.850000000003602 |  | 675.014 |  |
| 1.800000000003602 |  | 675.082 |  |
| 1.750000000003602 |  | 675.148 |  |
| 1.700000000003602 |  | 675.214 |  |
| 1.650000000003602 |  | 675.279 |  |
| 1.600000000003602 |  | 675.342 |  |
| 1.550000000003602 |  | 675.405 |  |
| 1.500000000003602 |  | 675.467 |  |
| 1.450000000003602 |  | 675.528 |  |
| 1.400000000003602 |  | 675.587 |  |
| 1.350000000003602 |  | 675.646 |  |
| 1.300000000003602 |  | 675.703 |  |
| 1.250000000003602 |  | 675.76 |  |
| 1.200000000003602 |  | 675.815 |  |
| 1.150000000003602 |  | 675.869 |  |
| 1.100000000003602 |  | 675.922 |  |
| 1.050000000003602 |  | 675.974 |  |
| 1.000000000003602 |  | 676.025 |  |